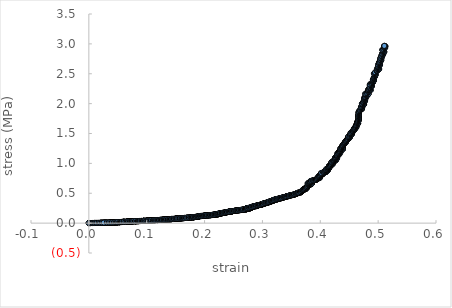
| Category | Series 0 |
|---|---|
| -0.00019422907024783148 | 0 |
| -0.00019422907024783148 | 0 |
| 0.0005007324903722929 | 0 |
| -0.0002555723664461956 | 0 |
| 6.132766122114415e-05 | 0.001 |
| 0.0 | 0.001 |
| 0.0 | 0.001 |
| 0.00031681910013293995 | 0.001 |
| -0.0003271443418882408 | 0 |
| 0.00018397166138515653 | 0 |
| 0.0002452880816213144 | 0 |
| 0.0 | 0.001 |
| 0.001970823531875488 | 0.001 |
| 0.002674476666898595 | 0.001 |
| 0.0031840613443490156 | 0.001 |
| 0.002674476666898595 | 0.001 |
| -7.155368530579731e-05 | 0.001 |
| 0.00031681910013293995 | 0.001 |
| -7.155368530579731e-05 | 0.001 |
| 0.002674476666898595 | 0.001 |
| 0.003499873115924939 | 0.001 |
| 0.005911017968440343 | 0.001 |
| 0.006104064549347594 | 0.001 |
| 0.005789074271497078 | 0.001 |
| 0.0036322811246846777 | 0.002 |
| 0.002990450188354925 | 0.002 |
| 0.005850047978751752 | 0.002 |
| 0.007434059230218116 | 0.002 |
| 0.009086470519888975 | 0.002 |
| 0.009521933733494064 | 0.002 |
| 0.00883321129383255 | 0.002 |
| 0.006165019054087078 | 0.002 |
| 0.007565946581062292 | 0.002 |
| 0.008954785957806435 | 0.002 |
| 0.00959280459431884 | 0.003 |
| 0.00984587154373883 | 0.003 |
| 0.011736786147582721 | 0.003 |
| 0.011989319118557815 | 0.003 |
| 0.011615557200545662 | 0.003 |
| 0.009653543637057733 | 0.003 |
| 0.00984587154373883 | 0.003 |
| 0.011676173511121391 | 0.003 |
| 0.013250988600911593 | 0.003 |
| 0.01388627292834074 | 0.003 |
| 0.014450631494363755 | 0.004 |
| 0.014198719399812928 | 0.004 |
| 0.01412818215084565 | 0.004 |
| 0.014631962578784456 | 0.004 |
| 0.01400723485460206 | 0.004 |
| 0.016775233965636866 | 0.004 |
| 0.017468550245519052 | 0.004 |
| 0.019966530072956335 | 0.004 |
| 0.020657638065205836 | 0.004 |
| 0.019906414230916346 | 0.004 |
| 0.018030891306773367 | 0.005 |
| 0.017468550245519052 | 0.005 |
| 0.019966530072956335 | 0.005 |
| 0.021718411273140496 | 0.005 |
| 0.022847998053342977 | 0.005 |
| 0.02290793732472039 | 0.005 |
| 0.02271811337668817 | 0.005 |
| 0.020287102630732884 | 0.005 |
| 0.020156884885051195 | 0.005 |
| 0.019906414230916346 | 0.005 |
| 0.02240831000338939 | 0.006 |
| 0.022847998053342977 | 0.006 |
| 0.022847998053342977 | 0.006 |
| 0.023097733101499877 | 0.006 |
| 0.022847998053342977 | 0.006 |
| 0.022847998053342977 | 0.006 |
| 0.023217585974407116 | 0.006 |
| 0.02584072590126089 | 0.006 |
| 0.027333737855004675 | 0.006 |
| 0.02875500317884615 | 0.006 |
| 0.02919191010796904 | 0.007 |
| 0.028943684740424934 | 0.007 |
| 0.028943684740424934 | 0.007 |
| 0.02938050925904356 | 0.007 |
| 0.028814589442823422 | 0.007 |
| 0.027015416673052944 | 0.007 |
| 0.026268947750183125 | 0.007 |
| 0.028814589442823422 | 0.007 |
| 0.02949961152842504 | 0.007 |
| 0.02875500317884615 | 0.008 |
| 0.026517830033072818 | 0.008 |
| 0.025900486064216355 | 0.008 |
| 0.026020003509482175 | 0.008 |
| 0.02633864165978307 | 0.008 |
| 0.02584072590126089 | 0.008 |
| 0.03111598990703239 | 0.008 |
| 0.03185885075842903 | 0.008 |
| 0.032037052787477996 | 0.009 |
| 0.031977650449101024 | 0.009 |
| 0.03185885075842903 | 0.009 |
| 0.034449571635362206 | 0.009 |
| 0.035495822754417504 | 0.009 |
| 0.03777207750859809 | 0.009 |
| 0.039375150274992006 | 0.009 |
| 0.04053405853690612 | 0.009 |
| 0.038696862140929066 | 0.009 |
| 0.03807715049436226 | 0.009 |
| 0.037831128909740705 | 0.01 |
| 0.03820506337307597 | 0.01 |
| 0.0376539565025511 | 0.01 |
| 0.03807715049436226 | 0.01 |
| 0.037959065520474476 | 0.01 |
| 0.037831128909740705 | 0.01 |
| 0.03691539749135247 | 0.01 |
| 0.03469642646142085 | 0.01 |
| 0.035002446807962814 | 0.01 |
| 0.035436633284940074 | 0.011 |
| 0.0375850467836038 | 0.011 |
| 0.039552018023367067 | 0.011 |
| 0.04072053085209076 | 0.011 |
| 0.04096585041044246 | 0.011 |
| 0.041024713521209066 | 0.011 |
| 0.04084810607645154 | 0.011 |
| 0.04132879597823537 | 0.011 |
| 0.040661649832935506 | 0.011 |
| 0.0432296943265158 | 0.012 |
| 0.04414944790030725 | 0.012 |
| 0.04640611189584293 | 0.012 |
| 0.046591500218072956 | 0.012 |
| 0.04640611189584293 | 0.012 |
| 0.044882693053802 | 0.012 |
| 0.04377773775988263 | 0.012 |
| 0.04371902878785748 | 0.012 |
| 0.044941326064711885 | 0.013 |
| 0.0463475647093781 | 0.013 |
| 0.04707919279440845 | 0.013 |
| 0.046220696873902026 | 0.013 |
| 0.0439636139475664 | 0.013 |
| 0.04414944790030725 | 0.013 |
| 0.043601608198186474 | 0.013 |
| 0.04433525501518401 | 0.013 |
| 0.04426680418370824 | 0.013 |
| 0.049085993933751425 | 0.014 |
| 0.049630830462436014 | 0.014 |
| 0.04957247177558727 | 0.014 |
| 0.049630830462436014 | 0.014 |
| 0.04895946540905637 | 0.014 |
| 0.04665003312495934 | 0.014 |
| 0.04822921219372078 | 0.014 |
| 0.0492027723438054 | 0.014 |
| 0.05000037935100698 | 0.014 |
| 0.04957247177558727 | 0.014 |
| 0.049630830462436014 | 0.015 |
| 0.048901067527925106 | 0.015 |
| 0.04646465565473518 | 0.015 |
| 0.04695241775093902 | 0.015 |
| 0.04689390254134561 | 0.015 |
| 0.04957247177558727 | 0.015 |
| 0.04968919339266308 | 0.015 |
| 0.0492027723438054 | 0.015 |
| 0.05200133265642445 | 0.016 |
| 0.052660958788462976 | 0.016 |
| 0.052544583545907186 | 0.016 |
| 0.0523602956787067 | 0.016 |
| 0.052243893068510995 | 0.016 |
| 0.05290335927350552 | 0.016 |
| 0.05272883745734763 | 0.016 |
| 0.05532414551323502 | 0.016 |
| 0.05544987133216124 | 0.016 |
| 0.05532414551323502 | 0.017 |
| 0.05321354678910859 | 0.017 |
| 0.05230209606730491 | 0.017 |
| 0.05230209606730491 | 0.017 |
| 0.05272883745734763 | 0.017 |
| 0.052243893068510995 | 0.017 |
| 0.05278701223858717 | 0.017 |
| 0.052243893068510995 | 0.017 |
| 0.052243893068510995 | 0.017 |
| 0.05175870576140698 | 0.017 |
| 0.04951410203254819 | 0.017 |
| 0.04975727407417879 | 0.018 |
| 0.04975727407417879 | 0.018 |
| 0.05217598147314629 | 0.018 |
| 0.053572082632199064 | 0.018 |
| 0.05520808741212849 | 0.018 |
| 0.05574960709299027 | 0.018 |
| 0.05544987133216124 | 0.018 |
| 0.05538217711861749 | 0.018 |
| 0.05629082609040494 | 0.019 |
| 0.057382048621037275 | 0.019 |
| 0.0577390932837422 | 0.019 |
| 0.05743995333938965 | 0.019 |
| 0.05762330754647387 | 0.019 |
| 0.057555760307176886 | 0.019 |
| 0.05749786229440041 | 0.019 |
| 0.05762330754647387 | 0.019 |
| 0.05768119829688549 | 0.02 |
| 0.0577390932837422 | 0.02 |
| 0.0577390932837422 | 0.02 |
| 0.05743995333938965 | 0.02 |
| 0.05803814377014822 | 0.02 |
| 0.05762330754647387 | 0.02 |
| 0.057555760307176886 | 0.02 |
| 0.05822138075541285 | 0.02 |
| 0.057382048621037275 | 0.021 |
| 0.059965323763090286 | 0.021 |
| 0.0605042741172144 | 0.021 |
| 0.060687067379437215 | 0.021 |
| 0.060812120787432554 | 0.021 |
| 0.0605042741172144 | 0.021 |
| 0.060812120787432554 | 0.021 |
| 0.06062934281909823 | 0.021 |
| 0.0605042741172144 | 0.021 |
| 0.060571622492570636 | 0.022 |
| 0.06044654657102045 | 0.022 |
| 0.06092753035150526 | 0.022 |
| 0.06062934281909823 | 0.022 |
| 0.060571622492570636 | 0.022 |
| 0.060985237702162666 | 0.022 |
| 0.0605042741172144 | 0.022 |
| 0.06062934281909823 | 0.022 |
| 0.060687067379437215 | 0.023 |
| 0.06308911414039864 | 0.023 |
| 0.06476710986046422 | 0.023 |
| 0.06614576229385935 | 0.023 |
| 0.06434547597822218 | 0.023 |
| 0.06351127042447355 | 0.023 |
| 0.06614576229385935 | 0.023 |
| 0.06686305305014417 | 0.023 |
| 0.06614576229385935 | 0.024 |
| 0.06835338410027192 | 0.024 |
| 0.06870652609959721 | 0.024 |
| 0.06662401329416213 | 0.024 |
| 0.06655707132004716 | 0.024 |
| 0.06614576229385935 | 0.024 |
| 0.0667387616136198 | 0.024 |
| 0.06626056550178977 | 0.024 |
| 0.06620316178347704 | 0.024 |
| 0.06620316178347704 | 0.024 |
| 0.06626056550178977 | 0.025 |
| 0.0667387616136198 | 0.025 |
| 0.066442302148843 | 0.025 |
| 0.06620316178347704 | 0.025 |
| 0.06769447588140913 | 0.025 |
| 0.06883058071937473 | 0.025 |
| 0.06888782631287999 | 0.025 |
| 0.06918356177171299 | 0.025 |
| 0.07180317183860627 | 0.026 |
| 0.07209803902943553 | 0.026 |
| 0.07192683544237108 | 0.026 |
| 0.07192683544237108 | 0.026 |
| 0.07209803902943553 | 0.026 |
| 0.07209803902943553 | 0.026 |
| 0.07222166617649 | 0.026 |
| 0.07180317183860627 | 0.026 |
| 0.07031797706945701 | 0.027 |
| 0.06912632560406265 | 0.027 |
| 0.06888782631287999 | 0.027 |
| 0.06876378629931865 | 0.027 |
| 0.06876378629931865 | 0.027 |
| 0.06888782631287999 | 0.027 |
| 0.06883058071937473 | 0.027 |
| 0.07156530271205995 | 0.027 |
| 0.07204097691704152 | 0.027 |
| 0.07198390406810462 | 0.028 |
| 0.0723928192992343 | 0.028 |
| 0.0718602475218867 | 0.028 |
| 0.07209803902943553 | 0.028 |
| 0.07281107447140123 | 0.028 |
| 0.07471003536511588 | 0.028 |
| 0.07476694538279555 | 0.028 |
| 0.07489024304079524 | 0.029 |
| 0.07518420894915377 | 0.029 |
| 0.07547808846695207 | 0.029 |
| 0.07476694538279555 | 0.029 |
| 0.07547808846695207 | 0.029 |
| 0.075127315216877 | 0.029 |
| 0.07507042570473911 | 0.029 |
| 0.07494715026220783 | 0.029 |
| 0.07476694538279555 | 0.029 |
| 0.07542121145259696 | 0.03 |
| 0.07507042570473911 | 0.03 |
| 0.07494715026220783 | 0.03 |
| 0.07565815779916259 | 0.03 |
| 0.07731521950557527 | 0.03 |
| 0.07991361202964987 | 0.03 |
| 0.08044193541650145 | 0.03 |
| 0.07784489479537025 | 0.03 |
| 0.07784489479537025 | 0.031 |
| 0.07731521950557527 | 0.031 |
| 0.07991361202964987 | 0.031 |
| 0.08062112062269089 | 0.031 |
| 0.08062112062269089 | 0.031 |
| 0.08132812900120809 | 0.031 |
| 0.08303224888456362 | 0.032 |
| 0.08373755522895576 | 0.032 |
| 0.08308869466121557 | 0.032 |
| 0.08096997982513636 | 0.032 |
| 0.08062112062269089 | 0.032 |
| 0.08056453538597183 | 0.032 |
| 0.08120562261829078 | 0.032 |
| 0.08079085712405053 | 0.032 |
| 0.08290995110218473 | 0.032 |
| 0.08290995110218473 | 0.033 |
| 0.08049852759079817 | 0.033 |
| 0.0806777026577023 | 0.033 |
| 0.08079085712405053 | 0.033 |
| 0.08303224888456362 | 0.033 |
| 0.0842074832450469 | 0.033 |
| 0.0855501947629191 | 0.033 |
| 0.08585042065028996 | 0.034 |
| 0.08572846705986165 | 0.034 |
| 0.08590670758145694 | 0.034 |
| 0.08619746064056119 | 0.034 |
| 0.0855501947629191 | 0.034 |
| 0.08749073689074487 | 0.034 |
| 0.08866067263798309 | 0.034 |
| 0.08853906130757119 | 0.035 |
| 0.08877292744208812 | 0.035 |
| 0.08848292235282766 | 0.035 |
| 0.08707857060561433 | 0.035 |
| 0.08619746064056119 | 0.035 |
| 0.08608491633903023 | 0.035 |
| 0.08690053885374142 | 0.035 |
| 0.08848292235282766 | 0.035 |
| 0.08848292235282766 | 0.035 |
| 0.0885951971109094 | 0.036 |
| 0.08866067263798309 | 0.036 |
| 0.0885951971109094 | 0.036 |
| 0.08842678024632515 | 0.036 |
| 0.08871680161517824 | 0.036 |
| 0.08866067263798309 | 0.036 |
| 0.09098719819029125 | 0.036 |
| 0.09215312613409099 | 0.037 |
| 0.09110851218168976 | 0.037 |
| 0.09367137789464822 | 0.037 |
| 0.09430411996419734 | 0.037 |
| 0.09163095556017277 | 0.037 |
| 0.09209718970864632 | 0.037 |
| 0.0943692227736259 | 0.037 |
| 0.0951223515840078 | 0.038 |
| 0.09448083862679169 | 0.038 |
| 0.09697942308282355 | 0.038 |
| 0.09697942308282355 | 0.038 |
| 0.09430411996419734 | 0.038 |
| 0.09471331946197319 | 0.038 |
| 0.09442503225747093 | 0.038 |
| 0.0943692227736259 | 0.038 |
| 0.09529892572170535 | 0.039 |
| 0.09726697493459072 | 0.039 |
| 0.09610699760123201 | 0.039 |
| 0.0943692227736259 | 0.039 |
| 0.09442503225747093 | 0.039 |
| 0.09553121646716929 | 0.039 |
| 0.09715566964287933 | 0.039 |
| 0.09801792534132035 | 0.04 |
| 0.09755444412405935 | 0.04 |
| 0.10010086385643564 | 0.04 |
| 0.10033204195859431 | 0.04 |
| 0.10004537024933235 | 0.04 |
| 0.10033204195859431 | 0.04 |
| 0.10004537024933235 | 0.04 |
| 0.0999898735625177 | 0.041 |
| 0.10033204195859431 | 0.041 |
| 0.0999898735625177 | 0.041 |
| 0.10120071812814412 | 0.041 |
| 0.10275151227254416 | 0.041 |
| 0.10050769867231697 | 0.041 |
| 0.10050769867231697 | 0.041 |
| 0.10004537024933235 | 0.041 |
| 0.10200410948047423 | 0.042 |
| 0.10246553341765036 | 0.042 |
| 0.10252089288726986 | 0.042 |
| 0.10304661879715285 | 0.042 |
| 0.10229022030442626 | 0.042 |
| 0.1031019461084281 | 0.042 |
| 0.10252089288726986 | 0.042 |
| 0.10258546297060885 | 0.043 |
| 0.10304661879715285 | 0.043 |
| 0.10522954245098518 | 0.043 |
| 0.105864199077422 | 0.043 |
| 0.10534914099506427 | 0.043 |
| 0.10545953808613362 | 0.043 |
| 0.10545953808613362 | 0.043 |
| 0.10522954245098518 | 0.044 |
| 0.10712306114001467 | 0.044 |
| 0.1084996349103657 | 0.044 |
| 0.10832537656095909 | 0.044 |
| 0.1084996349103657 | 0.044 |
| 0.1081602502968839 | 0.044 |
| 0.10729752911063653 | 0.045 |
| 0.10540434106403866 | 0.045 |
| 0.10522954245098518 | 0.045 |
| 0.10603888679825929 | 0.045 |
| 0.10827033750250996 | 0.045 |
| 0.10861884301818703 | 0.045 |
| 0.10844460544236012 | 0.045 |
| 0.1084996349103657 | 0.046 |
| 0.10872880764898564 | 0.046 |
| 0.10827033750250996 | 0.046 |
| 0.1084996349103657 | 0.046 |
| 0.10832537656095909 | 0.046 |
| 0.1107347463245245 | 0.046 |
| 0.111356714689508 | 0.046 |
| 0.11101837044403064 | 0.047 |
| 0.11164929302757529 | 0.047 |
| 0.11130184222500406 | 0.047 |
| 0.11124703867199423 | 0.047 |
| 0.1118138442102833 | 0.047 |
| 0.11335739412779035 | 0.047 |
| 0.11404156849036458 | 0.047 |
| 0.11375887239119789 | 0.048 |
| 0.11353077788446327 | 0.048 |
| 0.11341215391802746 | 0.048 |
| 0.11124703867199423 | 0.048 |
| 0.11290096982589036 | 0.048 |
| 0.11386827328154335 | 0.048 |
| 0.11375887239119789 | 0.049 |
| 0.11416011782106344 | 0.049 |
| 0.11603688894950583 | 0.049 |
| 0.11569095954429073 | 0.049 |
| 0.11358552818132496 | 0.049 |
| 0.11375887239119789 | 0.049 |
| 0.1142148336731597 | 0.049 |
| 0.11603688894950583 | 0.049 |
| 0.11813717087093689 | 0.05 |
| 0.11904497576659397 | 0.05 |
| 0.11904497576659397 | 0.05 |
| 0.11949860502599671 | 0.05 |
| 0.11920831456906024 | 0.05 |
| 0.1179100729601511 | 0.05 |
| 0.1163735397467632 | 0.05 |
| 0.11887261690960382 | 0.051 |
| 0.1196074511410218 | 0.051 |
| 0.11898145981011553 | 0.051 |
| 0.11972534251171325 | 0.051 |
| 0.11909942499853256 | 0.051 |
| 0.11909942499853256 | 0.051 |
| 0.11920831456906024 | 0.052 |
| 0.11909942499853256 | 0.052 |
| 0.11898145981011553 | 0.052 |
| 0.11915387126591372 | 0.052 |
| 0.1211933625001244 | 0.052 |
| 0.12181789999482623 | 0.052 |
| 0.12147396498490247 | 0.053 |
| 0.12198982315072299 | 0.053 |
| 0.12159170771034984 | 0.053 |
| 0.12198982315072299 | 0.053 |
| 0.12227027340113505 | 0.053 |
| 0.1243575177875217 | 0.053 |
| 0.12463730489563275 | 0.053 |
| 0.12458315637175398 | 0.054 |
| 0.12446583634013964 | 0.054 |
| 0.12491701374481325 | 0.054 |
| 0.12446583634013964 | 0.054 |
| 0.12514252613470944 | 0.054 |
| 0.124529004915654 | 0.054 |
| 0.12678271687165768 | 0.055 |
| 0.1273947865996015 | 0.055 |
| 0.12722379025458574 | 0.055 |
| 0.12666558380184129 | 0.055 |
| 0.12458315637175398 | 0.055 |
| 0.124529004915654 | 0.055 |
| 0.12508840496164583 | 0.055 |
| 0.12706175556288005 | 0.056 |
| 0.12728678485957884 | 0.056 |
| 0.12722379025458574 | 0.056 |
| 0.1274487830957872 | 0.056 |
| 0.1274487830957872 | 0.056 |
| 0.12711577004408345 | 0.057 |
| 0.12711577004408345 | 0.057 |
| 0.1273947865996015 | 0.057 |
| 0.1293097730539749 | 0.057 |
| 0.13031518315671292 | 0.057 |
| 0.1297587001543633 | 0.057 |
| 0.12986643526728928 | 0.057 |
| 0.12981256916168302 | 0.058 |
| 0.13014468550286556 | 0.058 |
| 0.13020749638144818 | 0.058 |
| 0.12969586107928288 | 0.058 |
| 0.1299831234451621 | 0.058 |
| 0.1299202984714945 | 0.059 |
| 0.13216183583663113 | 0.059 |
| 0.13238572051561792 | 0.059 |
| 0.1297587001543633 | 0.059 |
| 0.13036902219599178 | 0.059 |
| 0.1300369803647041 | 0.059 |
| 0.1296419857844782 | 0.059 |
| 0.1305394816085087 | 0.059 |
| 0.13227825649113895 | 0.06 |
| 0.13272592362691368 | 0.06 |
| 0.13260955508147476 | 0.06 |
| 0.13255583653853534 | 0.06 |
| 0.13283333955663035 | 0.06 |
| 0.1323319899469431 | 0.06 |
| 0.1335580602753685 | 0.061 |
| 0.13445197960635724 | 0.061 |
| 0.13434480769347615 | 0.061 |
| 0.13506836401368638 | 0.061 |
| 0.13451459079877834 | 0.061 |
| 0.1346217445181988 | 0.061 |
| 0.13473787915708718 | 0.062 |
| 0.13489867491166707 | 0.062 |
| 0.13473787915708718 | 0.062 |
| 0.13445197960635724 | 0.062 |
| 0.13635351200239162 | 0.062 |
| 0.1374676866908755 | 0.063 |
| 0.13774383018553163 | 0.063 |
| 0.1376280441377051 | 0.063 |
| 0.1372984042741497 | 0.063 |
| 0.13824247457429625 | 0.063 |
| 0.13757459451254564 | 0.063 |
| 0.13740533019399834 | 0.064 |
| 0.1379130372226509 | 0.064 |
| 0.13985238984344955 | 0.064 |
| 0.1406874890400072 | 0.064 |
| 0.1400745595195866 | 0.064 |
| 0.1399057178630976 | 0.065 |
| 0.14034998417975783 | 0.065 |
| 0.13979905897977238 | 0.065 |
| 0.1401900626576376 | 0.065 |
| 0.1399679186441637 | 0.065 |
| 0.140296679847322 | 0.065 |
| 0.14057204334529277 | 0.065 |
| 0.1426303256761377 | 0.066 |
| 0.14201865592873977 | 0.066 |
| 0.1401900626576376 | 0.066 |
| 0.14185014222547762 | 0.066 |
| 0.14268350576347627 | 0.066 |
| 0.1401900626576376 | 0.066 |
| 0.1414065420265858 | 0.067 |
| 0.14278985745454068 | 0.067 |
| 0.14278985745454068 | 0.067 |
| 0.14295821289061325 | 0.067 |
| 0.14278985745454068 | 0.067 |
| 0.14301137554420332 | 0.067 |
| 0.14278985745454068 | 0.068 |
| 0.1426303256761377 | 0.068 |
| 0.1433479835171046 | 0.068 |
| 0.14278985745454068 | 0.068 |
| 0.14417133155722323 | 0.068 |
| 0.14544477187814733 | 0.069 |
| 0.14511769909493388 | 0.069 |
| 0.14578056188357222 | 0.069 |
| 0.14549780250737918 | 0.069 |
| 0.14571872161585217 | 0.069 |
| 0.1453387021821948 | 0.069 |
| 0.1453917384365185 | 0.07 |
| 0.1456657027011162 | 0.07 |
| 0.1452768345828693 | 0.07 |
| 0.1456657027011162 | 0.07 |
| 0.1453387021821948 | 0.07 |
| 0.14362250819314384 | 0.07 |
| 0.1431265399879041 | 0.07 |
| 0.14273668302284373 | 0.071 |
| 0.1440651266946248 | 0.071 |
| 0.14549780250737918 | 0.071 |
| 0.14737839674986197 | 0.071 |
| 0.14781935630940624 | 0.072 |
| 0.14765181735568755 | 0.072 |
| 0.14775764199672797 | 0.072 |
| 0.14781935630940624 | 0.072 |
| 0.1499595943727702 | 0.072 |
| 0.1505137342339043 | 0.072 |
| 0.15029387201587735 | 0.073 |
| 0.15105878956076466 | 0.073 |
| 0.15292896461335076 | 0.073 |
| 0.1511730310003227 | 0.073 |
| 0.15046096894368843 | 0.073 |
| 0.15034664612351512 | 0.074 |
| 0.15046096894368843 | 0.074 |
| 0.15046096894368843 | 0.074 |
| 0.1503994174461936 | 0.074 |
| 0.15068079443052085 | 0.074 |
| 0.1503994174461936 | 0.074 |
| 0.15155084014846126 | 0.075 |
| 0.1528675648420421 | 0.075 |
| 0.15083904716032184 | 0.075 |
| 0.150733548123162 | 0.075 |
| 0.15264821959053076 | 0.075 |
| 0.15254291125681108 | 0.076 |
| 0.15046096894368843 | 0.076 |
| 0.151937276613395 | 0.076 |
| 0.15320087198938598 | 0.076 |
| 0.1527096328306513 | 0.076 |
| 0.15385840009427168 | 0.077 |
| 0.15511957180645683 | 0.077 |
| 0.15369186995069015 | 0.077 |
| 0.15308686199176494 | 0.077 |
| 0.15259556680990158 | 0.077 |
| 0.15358667147049732 | 0.077 |
| 0.1551720918622643 | 0.078 |
| 0.1567026344161488 | 0.078 |
| 0.15779437799990137 | 0.078 |
| 0.15762850208129892 | 0.078 |
| 0.15757611088134696 | 0.078 |
| 0.1577332762474085 | 0.079 |
| 0.15751499579048747 | 0.079 |
| 0.15784675776612442 | 0.079 |
| 0.15757611088134696 | 0.079 |
| 0.15866697038049118 | 0.079 |
| 0.16040110972162686 | 0.08 |
| 0.16007889313169768 | 0.08 |
| 0.1604620486870266 | 0.08 |
| 0.15784675776612442 | 0.08 |
| 0.15833548045373397 | 0.08 |
| 0.1577332762474085 | 0.08 |
| 0.15811733142098502 | 0.081 |
| 0.15806496582580024 | 0.081 |
| 0.16007889313169768 | 0.081 |
| 0.1604620486870266 | 0.081 |
| 0.16024436312060658 | 0.081 |
| 0.15838783188554545 | 0.082 |
| 0.15811733142098502 | 0.082 |
| 0.16002663015686264 | 0.082 |
| 0.16094949520359975 | 0.082 |
| 0.16307051769872705 | 0.083 |
| 0.16263623371061428 | 0.083 |
| 0.1632875889872856 | 0.083 |
| 0.16274048453463857 | 0.083 |
| 0.16225397880658501 | 0.083 |
| 0.1604620486870266 | 0.083 |
| 0.16176716789613943 | 0.084 |
| 0.1632875889872856 | 0.084 |
| 0.16512639927836087 | 0.084 |
| 0.16566354992789578 | 0.085 |
| 0.16544699383580322 | 0.085 |
| 0.1636608496060304 | 0.085 |
| 0.1632875889872856 | 0.085 |
| 0.16274048453463857 | 0.085 |
| 0.16279260587134617 | 0.085 |
| 0.1631226218369513 | 0.085 |
| 0.16452827195662428 | 0.086 |
| 0.16582809847509436 | 0.086 |
| 0.16550762609402248 | 0.086 |
| 0.16566354992789578 | 0.086 |
| 0.16550762609402248 | 0.087 |
| 0.16517839640946672 | 0.087 |
| 0.1657761351165375 | 0.087 |
| 0.1678264674760927 | 0.087 |
| 0.16928592936977965 | 0.088 |
| 0.17068301648097348 | 0.088 |
| 0.17046754477825402 | 0.088 |
| 0.17068301648097348 | 0.088 |
| 0.16837079718413783 | 0.088 |
| 0.16880259840635592 | 0.089 |
| 0.1682066665371333 | 0.089 |
| 0.17003646203861134 | 0.089 |
| 0.17101043915587233 | 0.089 |
| 0.17074333210656112 | 0.089 |
| 0.17101043915587233 | 0.09 |
| 0.17084674121912383 | 0.09 |
| 0.16928592936977965 | 0.09 |
| 0.168690353456658 | 0.09 |
| 0.17025202663747366 | 0.09 |
| 0.17197480493263065 | 0.091 |
| 0.17347986425562403 | 0.091 |
| 0.17347986425562403 | 0.091 |
| 0.17359157292224112 | 0.091 |
| 0.17331657009292606 | 0.091 |
| 0.17342829700138687 | 0.092 |
| 0.1735314288508166 | 0.092 |
| 0.173746241454338 | 0.092 |
| 0.17385792036993777 | 0.092 |
| 0.17605464015750685 | 0.093 |
| 0.17658588683096624 | 0.093 |
| 0.17626891148466778 | 0.093 |
| 0.17632033246783035 | 0.093 |
| 0.17632033246783035 | 0.094 |
| 0.17610607215960872 | 0.094 |
| 0.17643172429739865 | 0.094 |
| 0.17626891148466778 | 0.094 |
| 0.17605464015750685 | 0.094 |
| 0.17637175080701104 | 0.095 |
| 0.17621748785725208 | 0.095 |
| 0.17632033246783035 | 0.095 |
| 0.17626891148466778 | 0.095 |
| 0.17621748785725208 | 0.095 |
| 0.17648313690946263 | 0.095 |
| 0.17835772242619818 | 0.096 |
| 0.17878523366109886 | 0.096 |
| 0.17872540115713365 | 0.096 |
| 0.17893910104136646 | 0.097 |
| 0.17888781454514022 | 0.097 |
| 0.17857150088938026 | 0.097 |
| 0.1792039609808329 | 0.097 |
| 0.18097116793723939 | 0.098 |
| 0.18123555734211677 | 0.098 |
| 0.1810223476995252 | 0.098 |
| 0.1806981873237089 | 0.098 |
| 0.18123555734211677 | 0.098 |
| 0.1810223476995252 | 0.099 |
| 0.1807579019108126 | 0.099 |
| 0.18112469936666223 | 0.099 |
| 0.1806981873237089 | 0.099 |
| 0.18133788719033403 | 0.099 |
| 0.18112469936666223 | 0.1 |
| 0.18064699096785827 | 0.1 |
| 0.1810223476995252 | 0.1 |
| 0.17888781454514022 | 0.1 |
| 0.17947734973828935 | 0.1 |
| 0.18091146608425082 | 0.101 |
| 0.1807579019108126 | 0.101 |
| 0.18123555734211677 | 0.101 |
| 0.18091146608425082 | 0.101 |
| 0.18112469936666223 | 0.101 |
| 0.1810223476995252 | 0.102 |
| 0.18277777639699475 | 0.102 |
| 0.1837904666992485 | 0.102 |
| 0.18357780115054345 | 0.103 |
| 0.18421559530337403 | 0.103 |
| 0.18591457167019215 | 0.103 |
| 0.18436862945646304 | 0.103 |
| 0.18373086603771033 | 0.103 |
| 0.18346720254198604 | 0.103 |
| 0.1841050672153697 | 0.104 |
| 0.18362884768308155 | 0.104 |
| 0.18490403123160068 | 0.104 |
| 0.18622857148277056 | 0.105 |
| 0.1858042312177186 | 0.105 |
| 0.18591457167019215 | 0.105 |
| 0.18591457167019215 | 0.105 |
| 0.185591993541837 | 0.105 |
| 0.18617765748814055 | 0.106 |
| 0.18797489272918586 | 0.106 |
| 0.18855916316592172 | 0.106 |
| 0.18844911414939292 | 0.107 |
| 0.18855916316592172 | 0.107 |
| 0.18850836769586826 | 0.107 |
| 0.18850836769586826 | 0.107 |
| 0.18844911414939292 | 0.107 |
| 0.18839831308889812 | 0.108 |
| 0.18823743713496507 | 0.108 |
| 0.18855916316592172 | 0.108 |
| 0.18844911414939292 | 0.108 |
| 0.18866074636614477 | 0.108 |
| 0.18850836769586826 | 0.109 |
| 0.18829670322500994 | 0.109 |
| 0.18850836769586826 | 0.109 |
| 0.18813581092234724 | 0.109 |
| 0.18860995605592648 | 0.11 |
| 0.18850836769586826 | 0.11 |
| 0.18950676112674872 | 0.11 |
| 0.19067317371182133 | 0.11 |
| 0.18855916316592172 | 0.11 |
| 0.18844911414939292 | 0.111 |
| 0.18844911414939292 | 0.111 |
| 0.18823743713496507 | 0.111 |
| 0.18855916316592172 | 0.111 |
| 0.1903014227288697 | 0.112 |
| 0.19067317371182133 | 0.112 |
| 0.19062248551322217 | 0.112 |
| 0.19067317371182133 | 0.112 |
| 0.19062248551322217 | 0.113 |
| 0.18882148768548618 | 0.113 |
| 0.1889315622794363 | 0.113 |
| 0.19056335710710157 | 0.113 |
| 0.19067317371182133 | 0.114 |
| 0.19067317371182133 | 0.114 |
| 0.19062248551322217 | 0.114 |
| 0.19056335710710157 | 0.114 |
| 0.19062248551322217 | 0.114 |
| 0.18919378914057455 | 0.114 |
| 0.18855916316592172 | 0.115 |
| 0.19014085267292616 | 0.115 |
| 0.19067317371182133 | 0.115 |
| 0.19062248551322217 | 0.116 |
| 0.19188036109390802 | 0.116 |
| 0.19325467209521457 | 0.116 |
| 0.19082522289368065 | 0.116 |
| 0.1907238593412569 | 0.116 |
| 0.19056335710710157 | 0.117 |
| 0.19188036109390802 | 0.117 |
| 0.19335571319964984 | 0.117 |
| 0.19493830719748417 | 0.118 |
| 0.19551012842328094 | 0.118 |
| 0.1956698387133854 | 0.118 |
| 0.1943577531219283 | 0.119 |
| 0.19325467209521457 | 0.119 |
| 0.19320411458267045 | 0.119 |
| 0.19372633068938658 | 0.119 |
| 0.1956698387133854 | 0.12 |
| 0.19519902998575564 | 0.12 |
| 0.19598918279182728 | 0.12 |
| 0.19529994095532008 | 0.12 |
| 0.19540923866277884 | 0.12 |
| 0.19320411458267045 | 0.12 |
| 0.19398736961785185 | 0.121 |
| 0.19582952350018634 | 0.121 |
| 0.19524948674341563 | 0.121 |
| 0.19619915938992077 | 0.122 |
| 0.198297163235399 | 0.122 |
| 0.19802887217432055 | 0.122 |
| 0.1984479917741583 | 0.123 |
| 0.19802887217432055 | 0.123 |
| 0.19860729948921038 | 0.123 |
| 0.1983976961489213 | 0.123 |
| 0.19928583608073244 | 0.124 |
| 0.20070019663470431 | 0.124 |
| 0.20038235369103943 | 0.124 |
| 0.20033215526414752 | 0.125 |
| 0.20049109734180512 | 0.125 |
| 0.20054128779088884 | 0.125 |
| 0.20054128779088884 | 0.125 |
| 0.20038235369103943 | 0.125 |
| 0.2004409043735136 | 0.126 |
| 0.20038235369103943 | 0.126 |
| 0.2009593559295884 | 0.126 |
| 0.2006500141608931 | 0.127 |
| 0.2027887227083484 | 0.127 |
| 0.20320591812057814 | 0.127 |
| 0.20309746930495043 | 0.127 |
| 0.20304740699113769 | 0.128 |
| 0.20330595877652818 | 0.128 |
| 0.20471464883616905 | 0.128 |
| 0.20518099981462426 | 0.129 |
| 0.20518099981462426 | 0.129 |
| 0.20513104170118537 | 0.129 |
| 0.2054390006149347 | 0.13 |
| 0.2072103439034274 | 0.13 |
| 0.2079328908270913 | 0.13 |
| 0.20762569909001402 | 0.131 |
| 0.2077751925709172 | 0.131 |
| 0.20783331200624242 | 0.131 |
| 0.20746788705427194 | 0.131 |
| 0.2079328908270913 | 0.132 |
| 0.21021356576006503 | 0.132 |
| 0.21000644647871838 | 0.132 |
| 0.2104702715822386 | 0.133 |
| 0.21016385843878213 | 0.133 |
| 0.21021356576006503 | 0.133 |
| 0.21021356576006503 | 0.133 |
| 0.21155460019927197 | 0.134 |
| 0.21290208998378277 | 0.134 |
| 0.21295166138446003 | 0.134 |
| 0.2130590468299375 | 0.135 |
| 0.21269559184130482 | 0.135 |
| 0.21295166138446003 | 0.135 |
| 0.21290208998378277 | 0.135 |
| 0.21233193969737996 | 0.136 |
| 0.21279468768119622 | 0.136 |
| 0.21285251612565975 | 0.136 |
| 0.21310861045084759 | 0.137 |
| 0.2130012303279353 | 0.137 |
| 0.21253857793355335 | 0.137 |
| 0.21264600774496134 | 0.137 |
| 0.21274510849830894 | 0.137 |
| 0.21387650015557463 | 0.138 |
| 0.21537746028114377 | 0.138 |
| 0.2149653778794471 | 0.139 |
| 0.21522086693281323 | 0.139 |
| 0.2152703235244713 | 0.139 |
| 0.21517140789507955 | 0.139 |
| 0.2154763555318415 | 0.14 |
| 0.2149653778794471 | 0.14 |
| 0.2160447811197411 | 0.14 |
| 0.2181015369369144 | 0.141 |
| 0.218356290710241 | 0.141 |
| 0.21824947263795605 | 0.141 |
| 0.21799469164740215 | 0.142 |
| 0.21789604514712013 | 0.142 |
| 0.21531977767029606 | 0.142 |
| 0.2164070858284366 | 0.142 |
| 0.21830698650850816 | 0.143 |
| 0.21794536961365282 | 0.143 |
| 0.21815085126896522 | 0.143 |
| 0.2181015369369144 | 0.143 |
| 0.21769051112177118 | 0.144 |
| 0.2184055924811894 | 0.144 |
| 0.21824947263795605 | 0.144 |
| 0.21856168795482167 | 0.145 |
| 0.22040830267596898 | 0.145 |
| 0.22056408587275778 | 0.145 |
| 0.22061327891823798 | 0.146 |
| 0.22198963822407713 | 0.146 |
| 0.22275884709995147 | 0.146 |
| 0.22061327891823798 | 0.146 |
| 0.22020328440982606 | 0.147 |
| 0.22066246954388147 | 0.147 |
| 0.22219422624965754 | 0.147 |
| 0.22301241731459343 | 0.148 |
| 0.22301241731459343 | 0.148 |
| 0.22275884709995147 | 0.148 |
| 0.22291426457985453 | 0.149 |
| 0.22071165774992618 | 0.149 |
| 0.22056408587275778 | 0.149 |
| 0.22040830267596898 | 0.149 |
| 0.22107227587068898 | 0.149 |
| 0.22301241731459343 | 0.15 |
| 0.22266066947222501 | 0.15 |
| 0.2229633421514689 | 0.151 |
| 0.22291426457985453 | 0.151 |
| 0.22301241731459343 | 0.151 |
| 0.22301241731459343 | 0.151 |
| 0.22266066947222501 | 0.152 |
| 0.22327408941753507 | 0.152 |
| 0.22306965790891814 | 0.152 |
| 0.22373186696859335 | 0.153 |
| 0.22516100042507142 | 0.153 |
| 0.22342126194518397 | 0.153 |
| 0.22321686052413006 | 0.153 |
| 0.22306965790891814 | 0.154 |
| 0.22275884709995147 | 0.154 |
| 0.22311872785498488 | 0.154 |
| 0.22434463037297947 | 0.155 |
| 0.22500593176226977 | 0.155 |
| 0.225103879418761 | 0.155 |
| 0.22414041762189765 | 0.155 |
| 0.22311872785498488 | 0.156 |
| 0.22316779539331014 | 0.156 |
| 0.22311872785498488 | 0.156 |
| 0.22505490678973322 | 0.157 |
| 0.22489982167298478 | 0.157 |
| 0.22520996785881778 | 0.157 |
| 0.225103879418761 | 0.157 |
| 0.225103879418761 | 0.158 |
| 0.22516100042507142 | 0.158 |
| 0.22505490678973322 | 0.158 |
| 0.22536500488769481 | 0.159 |
| 0.22673478001364802 | 0.159 |
| 0.2276550953120321 | 0.16 |
| 0.2277039407715059 | 0.16 |
| 0.22775278384521735 | 0.16 |
| 0.22780975374796905 | 0.16 |
| 0.22714210591452713 | 0.161 |
| 0.22754926596856792 | 0.161 |
| 0.22754926596856792 | 0.161 |
| 0.227606247466563 | 0.162 |
| 0.22780975374796905 | 0.162 |
| 0.2276550953120321 | 0.162 |
| 0.2277039407715059 | 0.163 |
| 0.2277039407715059 | 0.163 |
| 0.22740269976192015 | 0.163 |
| 0.22780975374796905 | 0.163 |
| 0.2277039407715059 | 0.164 |
| 0.22775278384521735 | 0.164 |
| 0.22775278384521735 | 0.164 |
| 0.2279074271747044 | 0.165 |
| 0.23029725933309475 | 0.165 |
| 0.23009425869692698 | 0.165 |
| 0.23034597590833797 | 0.166 |
| 0.23014298516242904 | 0.166 |
| 0.22993995320291105 | 0.166 |
| 0.23029725933309475 | 0.167 |
| 0.23019170925377833 | 0.167 |
| 0.23014298516242904 | 0.167 |
| 0.23019170925377833 | 0.168 |
| 0.23003741879734596 | 0.168 |
| 0.23024043097120606 | 0.168 |
| 0.22983436540117433 | 0.168 |
| 0.23024043097120606 | 0.169 |
| 0.23034597590833797 | 0.169 |
| 0.22989121684313377 | 0.169 |
| 0.23029725933309475 | 0.17 |
| 0.23171704733718723 | 0.17 |
| 0.23232493868021017 | 0.171 |
| 0.23039469011039246 | 0.171 |
| 0.2309060141031031 | 0.171 |
| 0.23247078527807435 | 0.172 |
| 0.23237355657634012 | 0.172 |
| 0.23267330409943165 | 0.172 |
| 0.23474467892364306 | 0.173 |
| 0.23505178721172656 | 0.173 |
| 0.23510027271801695 | 0.173 |
| 0.23343440550773722 | 0.174 |
| 0.23247078527807435 | 0.174 |
| 0.2324221721088848 | 0.174 |
| 0.23328061459648963 | 0.174 |
| 0.23505178721172656 | 0.175 |
| 0.23505178721172656 | 0.175 |
| 0.23525378405830152 | 0.176 |
| 0.23510027271801695 | 0.176 |
| 0.23494673780838274 | 0.176 |
| 0.23520530599469536 | 0.177 |
| 0.23500329935447772 | 0.177 |
| 0.23514875587357714 | 0.177 |
| 0.23514875587357714 | 0.178 |
| 0.23540727183647153 | 0.178 |
| 0.23736820180914475 | 0.179 |
| 0.23696502087227686 | 0.179 |
| 0.2372150147378845 | 0.179 |
| 0.23716663166006907 | 0.18 |
| 0.2368682281798845 | 0.18 |
| 0.2372714481357424 | 0.18 |
| 0.23701341370539006 | 0.18 |
| 0.23731982614260275 | 0.181 |
| 0.23736820180914475 | 0.181 |
| 0.2368682281798845 | 0.181 |
| 0.23736820180914475 | 0.182 |
| 0.2374729971601816 | 0.182 |
| 0.23711824624121813 | 0.182 |
| 0.2372150147378845 | 0.183 |
| 0.2374729971601816 | 0.183 |
| 0.23958273271108974 | 0.184 |
| 0.23922872956616067 | 0.184 |
| 0.23968729625847895 | 0.184 |
| 0.23958273271108974 | 0.185 |
| 0.23942988452788244 | 0.185 |
| 0.23963099903442336 | 0.185 |
| 0.23948619307494629 | 0.185 |
| 0.23948619307494629 | 0.186 |
| 0.23942988452788244 | 0.186 |
| 0.23958273271108974 | 0.186 |
| 0.23958273271108974 | 0.187 |
| 0.23968729625847895 | 0.187 |
| 0.23963099903442336 | 0.188 |
| 0.24179237030031572 | 0.188 |
| 0.24224175049484417 | 0.189 |
| 0.24224175049484417 | 0.189 |
| 0.2423460363897034 | 0.189 |
| 0.24214546723066857 | 0.19 |
| 0.24214546723066857 | 0.19 |
| 0.2416880266468924 | 0.19 |
| 0.24219361002156456 | 0.191 |
| 0.2417442081882786 | 0.191 |
| 0.24199301028510434 | 0.191 |
| 0.24214546723066857 | 0.192 |
| 0.24219361002156456 | 0.192 |
| 0.2422898886507298 | 0.192 |
| 0.2430917452169988 | 0.193 |
| 0.2444455268837428 | 0.193 |
| 0.2444455268837428 | 0.194 |
| 0.24514167356205213 | 0.194 |
| 0.24693995818152825 | 0.195 |
| 0.24529365126339117 | 0.195 |
| 0.2446456352979749 | 0.195 |
| 0.24659652833399873 | 0.196 |
| 0.24693995818152825 | 0.196 |
| 0.24693995818152825 | 0.196 |
| 0.24659652833399873 | 0.197 |
| 0.24699584544299594 | 0.197 |
| 0.24693995818152825 | 0.197 |
| 0.24689204335712134 | 0.198 |
| 0.24699584544299594 | 0.198 |
| 0.24689204335712134 | 0.198 |
| 0.2468441262367742 | 0.199 |
| 0.24689204335712134 | 0.199 |
| 0.24669238400834168 | 0.199 |
| 0.2468441262367742 | 0.2 |
| 0.24828848101185827 | 0.2 |
| 0.2493325889924282 | 0.201 |
| 0.24709166285000278 | 0.201 |
| 0.24664445731970908 | 0.201 |
| 0.24693995818152825 | 0.201 |
| 0.24838417464781531 | 0.202 |
| 0.24953172194728176 | 0.203 |
| 0.2513697768741891 | 0.203 |
| 0.2515685046109994 | 0.204 |
| 0.2518148121783963 | 0.204 |
| 0.25132207383938876 | 0.204 |
| 0.2518704901557366 | 0.205 |
| 0.25176713036891313 | 0.205 |
| 0.25216438850576095 | 0.206 |
| 0.25419582148768005 | 0.206 |
| 0.25419582148768005 | 0.207 |
| 0.2540531718171971 | 0.207 |
| 0.25425136705661533 | 0.207 |
| 0.2534028230574729 | 0.208 |
| 0.2518704901557366 | 0.208 |
| 0.2529108043411008 | 0.208 |
| 0.2540531718171971 | 0.209 |
| 0.2542989305630221 | 0.209 |
| 0.2544415451829078 | 0.21 |
| 0.25597791209361304 | 0.21 |
| 0.2547426644865066 | 0.21 |
| 0.2543464294742026 | 0.211 |
| 0.25588294241227016 | 0.211 |
| 0.25588294241227016 | 0.212 |
| 0.25597791209361304 | 0.212 |
| 0.2574091439000936 | 0.213 |
| 0.25819903502489805 | 0.213 |
| 0.25830167009185134 | 0.214 |
| 0.25824641114094266 | 0.214 |
| 0.25824641114094266 | 0.214 |
| 0.25810427605878766 | 0.215 |
| 0.25834904134580977 | 0.215 |
| 0.2603679620259797 | 0.216 |
| 0.260415235500467 | 0.216 |
| 0.26071456164101614 | 0.217 |
| 0.26169850988204457 | 0.217 |
| 0.26277587897585764 | 0.218 |
| 0.26076175679932206 | 0.218 |
| 0.2602734083721323 | 0.218 |
| 0.2605649097702589 | 0.218 |
| 0.260470374737587 | 0.219 |
| 0.2605649097702589 | 0.219 |
| 0.2625793662386934 | 0.22 |
| 0.26262653529038876 | 0.22 |
| 0.26297235310335326 | 0.221 |
| 0.26282303875936286 | 0.221 |
| 0.26282303875936286 | 0.221 |
| 0.2630194418275407 | 0.222 |
| 0.2635143572474806 | 0.222 |
| 0.2654758542619829 | 0.223 |
| 0.2654758542619829 | 0.224 |
| 0.26542099034113686 | 0.224 |
| 0.2654758542619829 | 0.224 |
| 0.2655699173059892 | 0.225 |
| 0.2655228868899679 | 0.225 |
| 0.26674489786124167 | 0.226 |
| 0.267527451943162 | 0.226 |
| 0.2676291340876344 | 0.227 |
| 0.26787151787337654 | 0.227 |
| 0.27040966387840654 | 0.228 |
| 0.268793834851706 | 0.228 |
| 0.2675743881802924 | 0.228 |
| 0.26996497431292066 | 0.229 |
| 0.27040966387840654 | 0.23 |
| 0.27045646503328097 | 0.23 |
| 0.27157897487962124 | 0.231 |
| 0.27230320777030054 | 0.231 |
| 0.27065143605120245 | 0.231 |
| 0.2705500607724985 | 0.232 |
| 0.27234992039105194 | 0.232 |
| 0.27234992039105194 | 0.233 |
| 0.27234992039105194 | 0.233 |
| 0.2724044054879222 | 0.234 |
| 0.27234992039105194 | 0.234 |
| 0.2724511133818126 | 0.234 |
| 0.2733225530825451 | 0.235 |
| 0.27444179102715277 | 0.236 |
| 0.2726456959265117 | 0.236 |
| 0.27269239255185673 | 0.236 |
| 0.2745893806915015 | 0.237 |
| 0.27424755769145226 | 0.237 |
| 0.27434855884639114 | 0.237 |
| 0.27434855884639114 | 0.238 |
| 0.27444179102715277 | 0.238 |
| 0.2747835476515708 | 0.239 |
| 0.2753658224293602 | 0.239 |
| 0.2770563250513777 | 0.24 |
| 0.2768625989311799 | 0.24 |
| 0.27691683871491674 | 0.241 |
| 0.27720352936989684 | 0.241 |
| 0.27691683871491674 | 0.242 |
| 0.27696333632226355 | 0.242 |
| 0.27715704292987026 | 0.243 |
| 0.2766223239706245 | 0.243 |
| 0.2745893806915015 | 0.243 |
| 0.2745893806915015 | 0.243 |
| 0.27444179102715277 | 0.243 |
| 0.27444179102715277 | 0.244 |
| 0.2740067146234409 | 0.244 |
| 0.2724511133818126 | 0.244 |
| 0.2724511133818126 | 0.245 |
| 0.27230320777030054 | 0.245 |
| 0.2724044054879222 | 0.245 |
| 0.27210855856548377 | 0.246 |
| 0.2724044054879222 | 0.246 |
| 0.2722564929673781 | 0.246 |
| 0.27234992039105194 | 0.247 |
| 0.2724044054879222 | 0.247 |
| 0.2724044054879222 | 0.248 |
| 0.2724511133818126 | 0.248 |
| 0.2725445226252211 | 0.249 |
| 0.27234992039105194 | 0.249 |
| 0.2722564929673781 | 0.249 |
| 0.2724044054879222 | 0.25 |
| 0.2724978190941777 | 0.25 |
| 0.27337698521263404 | 0.251 |
| 0.27454283365397064 | 0.251 |
| 0.27434855884639114 | 0.252 |
| 0.2746359866435908 | 0.252 |
| 0.2770563250513777 | 0.253 |
| 0.276040841570516 | 0.253 |
| 0.2744884038581462 | 0.254 |
| 0.27633552759451113 | 0.254 |
| 0.27720352936989684 | 0.255 |
| 0.27715704292987026 | 0.255 |
| 0.277830854452045 | 0.256 |
| 0.27933166963219513 | 0.257 |
| 0.2774978730155454 | 0.257 |
| 0.27720352936989684 | 0.257 |
| 0.2794785394154966 | 0.258 |
| 0.2792852820189317 | 0.258 |
| 0.27942443840378833 | 0.259 |
| 0.2811158068140762 | 0.26 |
| 0.28121611667940494 | 0.26 |
| 0.28154786251369235 | 0.261 |
| 0.2814090013238521 | 0.261 |
| 0.28135500465415964 | 0.262 |
| 0.28005808761566203 | 0.262 |
| 0.2796717594708563 | 0.262 |
| 0.2814552905296576 | 0.263 |
| 0.2814552905296576 | 0.263 |
| 0.28135500465415964 | 0.264 |
| 0.2814090013238521 | 0.264 |
| 0.28106950189080787 | 0.264 |
| 0.27961766891182155 | 0.264 |
| 0.28034387924538257 | 0.265 |
| 0.2814552905296576 | 0.266 |
| 0.2814552905296576 | 0.266 |
| 0.2814090013238521 | 0.267 |
| 0.28154786251369235 | 0.267 |
| 0.28135500465415964 | 0.268 |
| 0.2814552905296576 | 0.268 |
| 0.2816481290511054 | 0.269 |
| 0.2814552905296576 | 0.269 |
| 0.2814552905296576 | 0.269 |
| 0.2814552905296576 | 0.27 |
| 0.2814552905296576 | 0.27 |
| 0.2816481290511054 | 0.271 |
| 0.2814090013238521 | 0.271 |
| 0.2815015775928714 | 0.271 |
| 0.2816944071894575 | 0.272 |
| 0.2814090013238521 | 0.273 |
| 0.28338194383458926 | 0.273 |
| 0.28352053134833044 | 0.274 |
| 0.2840515753743362 | 0.275 |
| 0.28376684156176113 | 0.275 |
| 0.28381302175610074 | 0.275 |
| 0.2837129720610372 | 0.276 |
| 0.28381302175610074 | 0.276 |
| 0.2840054061953893 | 0.277 |
| 0.28486683928321904 | 0.277 |
| 0.28578123162822916 | 0.278 |
| 0.2859271572827495 | 0.279 |
| 0.285689050725256 | 0.279 |
| 0.2840054061953893 | 0.279 |
| 0.28424391392950693 | 0.279 |
| 0.2858273188934168 | 0.28 |
| 0.2857351422389073 | 0.281 |
| 0.2858273188934168 | 0.281 |
| 0.28841994324497555 | 0.282 |
| 0.28827438092530827 | 0.283 |
| 0.28841994324497555 | 0.283 |
| 0.2861652071590062 | 0.283 |
| 0.28607306164608026 | 0.283 |
| 0.28846590906225955 | 0.285 |
| 0.28846590906225955 | 0.285 |
| 0.28832035343381657 | 0.286 |
| 0.2896602191305065 | 0.286 |
| 0.2898514218909065 | 0.287 |
| 0.28851187276678447 | 0.287 |
| 0.2882284063032314 | 0.287 |
| 0.2883663238289504 | 0.288 |
| 0.2885578343587443 | 0.288 |
| 0.2885578343587443 | 0.289 |
| 0.2901879534197336 | 0.29 |
| 0.28999675485041576 | 0.29 |
| 0.29013442872216233 | 0.291 |
| 0.2903791154391465 | 0.291 |
| 0.2902797205602581 | 0.292 |
| 0.2902797205602581 | 0.292 |
| 0.2897596154364154 | 0.292 |
| 0.2902797205602581 | 0.293 |
| 0.2918536046768372 | 0.294 |
| 0.29218946319513783 | 0.294 |
| 0.2926167618678956 | 0.295 |
| 0.2922352560734769 | 0.295 |
| 0.29238024302100496 | 0.296 |
| 0.2908988985413441 | 0.296 |
| 0.2902797205602581 | 0.296 |
| 0.2926167618678956 | 0.298 |
| 0.29242602716401994 | 0.298 |
| 0.29257098645687246 | 0.298 |
| 0.29242602716401994 | 0.299 |
| 0.29257098645687246 | 0.299 |
| 0.2926167618678956 | 0.3 |
| 0.29267015386765094 | 0.3 |
| 0.2925252089503654 | 0.301 |
| 0.29414127134131096 | 0.302 |
| 0.2945677370000567 | 0.302 |
| 0.2949483541455932 | 0.303 |
| 0.2947580636815012 | 0.303 |
| 0.29490268534227093 | 0.304 |
| 0.2949483541455932 | 0.304 |
| 0.2946667066056017 | 0.305 |
| 0.2949483541455932 | 0.305 |
| 0.29585363829175126 | 0.306 |
| 0.2970391031131945 | 0.307 |
| 0.2969935296943045 | 0.307 |
| 0.2968492101208192 | 0.308 |
| 0.29713782844265546 | 0.308 |
| 0.2969479541983829 | 0.309 |
| 0.2969935296943045 | 0.309 |
| 0.29727452274409844 | 0.31 |
| 0.29718339528598287 | 0.31 |
| 0.29964831354660754 | 0.312 |
| 0.29954983576695465 | 0.312 |
| 0.29954983576695465 | 0.313 |
| 0.29950437662981066 | 0.313 |
| 0.29950437662981066 | 0.314 |
| 0.29950437662981066 | 0.314 |
| 0.29950437662981066 | 0.315 |
| 0.29950437662981066 | 0.315 |
| 0.29950437662981066 | 0.316 |
| 0.29936041899219523 | 0.316 |
| 0.29950437662981066 | 0.317 |
| 0.2996937661411229 | 0.317 |
| 0.29941345215545345 | 0.318 |
| 0.29954983576695465 | 0.318 |
| 0.29945891542603953 | 0.319 |
| 0.30172926932784344 | 0.32 |
| 0.30158563164746155 | 0.32 |
| 0.30172926932784344 | 0.321 |
| 0.30172926932784344 | 0.321 |
| 0.3013966001307545 | 0.322 |
| 0.29979222974854985 | 0.322 |
| 0.3002616600240723 | 0.322 |
| 0.3016763588408419 | 0.323 |
| 0.30172926932784344 | 0.324 |
| 0.30163099627307965 | 0.324 |
| 0.3017746274380077 | 0.325 |
| 0.30163099627307965 | 0.325 |
| 0.3017746274380077 | 0.326 |
| 0.30186533748672817 | 0.326 |
| 0.30163099627307965 | 0.327 |
| 0.30370783454386124 | 0.328 |
| 0.30394168963058993 | 0.329 |
| 0.3038964297100658 | 0.329 |
| 0.30398694750274635 | 0.33 |
| 0.30375310300079916 | 0.33 |
| 0.30398694750274635 | 0.331 |
| 0.30403973587973065 | 0.331 |
| 0.3038511677409885 | 0.332 |
| 0.30394168963058993 | 0.332 |
| 0.30394168963058993 | 0.333 |
| 0.3059234049583275 | 0.334 |
| 0.3058255432310679 | 0.334 |
| 0.3058707159262003 | 0.335 |
| 0.3059234049583275 | 0.336 |
| 0.3059234049583275 | 0.336 |
| 0.3060589036625806 | 0.336 |
| 0.3057351917186252 | 0.337 |
| 0.3059685732330979 | 0.338 |
| 0.3058255432310679 | 0.338 |
| 0.3058707159262003 | 0.339 |
| 0.307660764728036 | 0.34 |
| 0.3080815047906548 | 0.341 |
| 0.30775094243727846 | 0.341 |
| 0.3078936973340403 | 0.341 |
| 0.3076081671586463 | 0.342 |
| 0.307848615932117 | 0.343 |
| 0.30831433942460024 | 0.343 |
| 0.30991259454896036 | 0.344 |
| 0.31018998128004477 | 0.345 |
| 0.31000256943093485 | 0.345 |
| 0.310145003281382 | 0.346 |
| 0.30892239519907805 | 0.346 |
| 0.3077960282425757 | 0.346 |
| 0.30793877670372266 | 0.347 |
| 0.30775094243727846 | 0.347 |
| 0.30977012758943717 | 0.348 |
| 0.30995758300188264 | 0.349 |
| 0.30995758300188264 | 0.35 |
| 0.3100475538362994 | 0.35 |
| 0.3096276403301875 | 0.35 |
| 0.310145003281382 | 0.351 |
| 0.3100475538362994 | 0.352 |
| 0.30995758300188264 | 0.352 |
| 0.31028741684731637 | 0.353 |
| 0.30977012758943717 | 0.353 |
| 0.31010002325960767 | 0.354 |
| 0.31056469964156236 | 0.355 |
| 0.3122042525129232 | 0.356 |
| 0.311081519250243 | 0.356 |
| 0.31018998128004477 | 0.356 |
| 0.31224913798805265 | 0.357 |
| 0.31210700354380755 | 0.358 |
| 0.31224913798805265 | 0.359 |
| 0.31402035786361976 | 0.36 |
| 0.31425181398434215 | 0.36 |
| 0.3145802347159075 | 0.361 |
| 0.3143936439254323 | 0.362 |
| 0.31449067078595366 | 0.362 |
| 0.31332566789613875 | 0.362 |
| 0.3123389028946462 | 0.362 |
| 0.31453545375364295 | 0.364 |
| 0.31476679069675456 | 0.365 |
| 0.3166750675094943 | 0.366 |
| 0.31537093683284617 | 0.366 |
| 0.31430406328136623 | 0.366 |
| 0.31453545375364295 | 0.367 |
| 0.31453545375364295 | 0.367 |
| 0.31453545375364295 | 0.368 |
| 0.31584061513823036 | 0.369 |
| 0.3166750675094943 | 0.37 |
| 0.31672719034980495 | 0.37 |
| 0.316771873273665 | 0.371 |
| 0.3166750675094943 | 0.372 |
| 0.316771873273665 | 0.372 |
| 0.31663038025976364 | 0.373 |
| 0.3168165542010505 | 0.373 |
| 0.3174194636215948 | 0.374 |
| 0.31890671240061896 | 0.375 |
| 0.31904788371844095 | 0.376 |
| 0.31876552115064194 | 0.376 |
| 0.31700269348805254 | 0.376 |
| 0.31663038025976364 | 0.377 |
| 0.31672719034980495 | 0.377 |
| 0.3168165542010505 | 0.378 |
| 0.31663038025976364 | 0.378 |
| 0.3188175351472111 | 0.38 |
| 0.3191890351097352 | 0.38 |
| 0.31913704043327734 | 0.381 |
| 0.31895129804528166 | 0.382 |
| 0.3188175351472111 | 0.382 |
| 0.3192336081689152 | 0.383 |
| 0.3194192981322228 | 0.383 |
| 0.3211333881401476 | 0.385 |
| 0.3211333881401476 | 0.385 |
| 0.32099251094966347 | 0.386 |
| 0.3230739679970481 | 0.387 |
| 0.32275571830711147 | 0.388 |
| 0.3211778746196906 | 0.388 |
| 0.32090351951645885 | 0.388 |
| 0.3211333881401476 | 0.389 |
| 0.32140762190364525 | 0.39 |
| 0.3217337595607542 | 0.39 |
| 0.3232589462774656 | 0.391 |
| 0.3220152271149705 | 0.392 |
| 0.3212223591202748 | 0.392 |
| 0.3212223591202748 | 0.392 |
| 0.32090351951645885 | 0.393 |
| 0.3210888996814697 | 0.394 |
| 0.32238554125194013 | 0.395 |
| 0.3233551168083115 | 0.396 |
| 0.32552025648972627 | 0.397 |
| 0.3256604973106111 | 0.398 |
| 0.3256604973106111 | 0.398 |
| 0.3246931555004859 | 0.399 |
| 0.3233107270833912 | 0.399 |
| 0.32533569606855334 | 0.4 |
| 0.32543166709408594 | 0.401 |
| 0.32557192033849935 | 0.401 |
| 0.3270470446155058 | 0.403 |
| 0.3274155004218709 | 0.403 |
| 0.3258892171464957 | 0.403 |
| 0.3258892171464957 | 0.404 |
| 0.3256604973106111 | 0.405 |
| 0.3257047828546355 | 0.405 |
| 0.3257047828546355 | 0.406 |
| 0.3276438771791617 | 0.407 |
| 0.3280120552788901 | 0.408 |
| 0.32777646471312155 | 0.408 |
| 0.329020332397931 | 0.41 |
| 0.3298953045398764 | 0.411 |
| 0.32805623680753815 | 0.41 |
| 0.3283802136433652 | 0.411 |
| 0.3301231157335804 | 0.413 |
| 0.3300349331833937 | 0.413 |
| 0.3301231157335804 | 0.414 |
| 0.33222961367349557 | 0.415 |
| 0.33173093861841585 | 0.416 |
| 0.3301231157335804 | 0.416 |
| 0.3316355702690564 | 0.417 |
| 0.33204628750247933 | 0.418 |
| 0.3325082004906344 | 0.418 |
| 0.33246421522367403 | 0.419 |
| 0.33465363403442383 | 0.421 |
| 0.33324096518236024 | 0.421 |
| 0.3322809897197858 | 0.421 |
| 0.3344268527258235 | 0.423 |
| 0.3347925999031119 | 0.423 |
| 0.3347048281781012 | 0.424 |
| 0.3345659076387866 | 0.425 |
| 0.3345220127895525 | 0.425 |
| 0.3347925999031119 | 0.426 |
| 0.3347048281781012 | 0.426 |
| 0.3346098005613477 | 0.427 |
| 0.3349754233398603 | 0.428 |
| 0.3346098005613477 | 0.428 |
| 0.3365317203825656 | 0.43 |
| 0.33680176431456743 | 0.431 |
| 0.33680176431456743 | 0.431 |
| 0.33675802490249723 | 0.432 |
| 0.3365317203825656 | 0.432 |
| 0.3368455592106207 | 0.433 |
| 0.3368455592106207 | 0.434 |
| 0.3384863988412932 | 0.435 |
| 0.33876319099561614 | 0.436 |
| 0.3384863988412932 | 0.437 |
| 0.3386247758476907 | 0.437 |
| 0.33876319099561614 | 0.438 |
| 0.338668490979616 | 0.438 |
| 0.3396733547003734 | 0.44 |
| 0.3407135739312288 | 0.441 |
| 0.340895261006557 | 0.442 |
| 0.3411714444503608 | 0.442 |
| 0.3425294175067851 | 0.444 |
| 0.3415347335589457 | 0.444 |
| 0.3406699481109685 | 0.444 |
| 0.3407135739312288 | 0.445 |
| 0.3409897503919624 | 0.446 |
| 0.3408516431119972 | 0.446 |
| 0.3428052071103407 | 0.448 |
| 0.3449286288432879 | 0.449 |
| 0.34311708354362747 | 0.449 |
| 0.34325487832543855 | 0.45 |
| 0.34497206927418056 | 0.451 |
| 0.34375513733136787 | 0.452 |
| 0.34262380968145845 | 0.452 |
| 0.34479106451851105 | 0.453 |
| 0.34502279483328935 | 0.454 |
| 0.3451096087031259 | 0.455 |
| 0.3458766019376237 | 0.456 |
| 0.3466502256725872 | 0.457 |
| 0.3453339805269962 | 0.457 |
| 0.34515304127305774 | 0.457 |
| 0.34669359138253136 | 0.459 |
| 0.3466502256725872 | 0.46 |
| 0.3468308374274821 | 0.46 |
| 0.34916930679043473 | 0.462 |
| 0.3487655638154368 | 0.463 |
| 0.3467803171610731 | 0.463 |
| 0.34790695484078205 | 0.464 |
| 0.34912604831117794 | 0.465 |
| 0.349486459580726 | 0.466 |
| 0.34970985161801793 | 0.467 |
| 0.35128651348117035 | 0.468 |
| 0.35178277167411454 | 0.469 |
| 0.3511929920839525 | 0.469 |
| 0.35146634644517294 | 0.47 |
| 0.35124334649414374 | 0.471 |
| 0.35128651348117035 | 0.472 |
| 0.3522284814199794 | 0.473 |
| 0.3532198178720814 | 0.474 |
| 0.3533059230657485 | 0.475 |
| 0.3534423211020767 | 0.475 |
| 0.3554144553228738 | 0.477 |
| 0.35446832303768816 | 0.477 |
| 0.35316950642245803 | 0.477 |
| 0.3550561182700513 | 0.479 |
| 0.3554573862959041 | 0.48 |
| 0.3554144553228738 | 0.481 |
| 0.35563647082853517 | 0.481 |
| 0.3554144553228738 | 0.482 |
| 0.3555433553807757 | 0.483 |
| 0.35550037176217536 | 0.484 |
| 0.3555433553807757 | 0.484 |
| 0.3554573862959041 | 0.485 |
| 0.3553642541703383 | 0.486 |
| 0.35755419554738826 | 0.488 |
| 0.35769001539606027 | 0.488 |
| 0.35782581680020564 | 0.489 |
| 0.3579615997648342 | 0.49 |
| 0.3576042306675556 | 0.49 |
| 0.3577829311802789 | 0.491 |
| 0.3576042306675556 | 0.492 |
| 0.35773290500083793 | 0.493 |
| 0.3587188023893885 | 0.494 |
| 0.35969654792545147 | 0.495 |
| 0.3599675879714824 | 0.496 |
| 0.35956812603090743 | 0.497 |
| 0.35969654792545147 | 0.497 |
| 0.3599675879714824 | 0.498 |
| 0.3596109351615796 | 0.499 |
| 0.3597892774666842 | 0.5 |
| 0.3598320771313054 | 0.5 |
| 0.3617916063865524 | 0.502 |
| 0.361969560244018 | 0.503 |
| 0.3617488905087995 | 0.503 |
| 0.361969560244018 | 0.504 |
| 0.361969560244018 | 0.505 |
| 0.3618770326685095 | 0.506 |
| 0.36219018129484726 | 0.507 |
| 0.3616990623431778 | 0.507 |
| 0.36201226669691067 | 0.508 |
| 0.3619268519672062 | 0.509 |
| 0.3618770326685095 | 0.51 |
| 0.36303661888210276 | 0.511 |
| 0.36405277324056956 | 0.512 |
| 0.3659189829573358 | 0.514 |
| 0.3660962039108241 | 0.515 |
| 0.3661387344962717 | 0.516 |
| 0.3660536715164487 | 0.516 |
| 0.3658764430245006 | 0.517 |
| 0.3661812632729456 | 0.518 |
| 0.3659189829573358 | 0.519 |
| 0.3660962039108241 | 0.519 |
| 0.3661387344962717 | 0.52 |
| 0.365961521080602 | 0.521 |
| 0.366315916512911 | 0.522 |
| 0.3659189829573358 | 0.522 |
| 0.36600405739445313 | 0.523 |
| 0.36645055162382273 | 0.524 |
| 0.3659189829573358 | 0.525 |
| 0.3675127863477901 | 0.526 |
| 0.3679939932040364 | 0.527 |
| 0.3679939932040364 | 0.528 |
| 0.36790908789843874 | 0.529 |
| 0.3678666325421452 | 0.53 |
| 0.3682203535736583 | 0.531 |
| 0.36768972509585873 | 0.531 |
| 0.3678171082893574 | 0.532 |
| 0.36808595654549936 | 0.533 |
| 0.36777464902777424 | 0.534 |
| 0.3678666325421452 | 0.534 |
| 0.3678666325421452 | 0.535 |
| 0.36790908789843874 | 0.536 |
| 0.3678666325421452 | 0.537 |
| 0.3678666325421452 | 0.538 |
| 0.36804350869772273 | 0.539 |
| 0.36808595654549936 | 0.539 |
| 0.3679939932040364 | 0.54 |
| 0.36808595654549936 | 0.541 |
| 0.36777464902777424 | 0.542 |
| 0.36998702885731743 | 0.544 |
| 0.36998702885731743 | 0.544 |
| 0.3679939932040364 | 0.544 |
| 0.3691040535706133 | 0.546 |
| 0.37024824451092253 | 0.547 |
| 0.3704670468481957 | 0.548 |
| 0.3703823512674283 | 0.549 |
| 0.37042469995447985 | 0.55 |
| 0.370777517459486 | 0.55 |
| 0.370205888350397 | 0.551 |
| 0.3705093919487281 | 0.552 |
| 0.37024824451092253 | 0.553 |
| 0.3703823512674283 | 0.553 |
| 0.3705587830507925 | 0.554 |
| 0.3701635303957515 | 0.555 |
| 0.37060112426700675 | 0.556 |
| 0.37024824451092253 | 0.556 |
| 0.3702905988774792 | 0.557 |
| 0.3703823512674283 | 0.558 |
| 0.3701635303957515 | 0.559 |
| 0.3717928792877776 | 0.56 |
| 0.3722297609020827 | 0.561 |
| 0.3722297609020827 | 0.561 |
| 0.37240586707323114 | 0.562 |
| 0.372095901683551 | 0.562 |
| 0.3709538795428941 | 0.562 |
| 0.3701635303957515 | 0.562 |
| 0.37042469995447985 | 0.563 |
| 0.37024824451092253 | 0.563 |
| 0.37024824451092253 | 0.564 |
| 0.3718774554923185 | 0.566 |
| 0.3720536237120883 | 0.567 |
| 0.3722297609020827 | 0.567 |
| 0.37249742559626503 | 0.568 |
| 0.3720536237120883 | 0.569 |
| 0.37249742559626503 | 0.57 |
| 0.37232133554981905 | 0.571 |
| 0.3742495456654332 | 0.572 |
| 0.37473454083991287 | 0.574 |
| 0.3741229792783606 | 0.574 |
| 0.37600561068921623 | 0.576 |
| 0.3760547310782773 | 0.577 |
| 0.37455884432145475 | 0.577 |
| 0.37447449460438265 | 0.578 |
| 0.37416516985397086 | 0.578 |
| 0.37473454083991287 | 0.58 |
| 0.37416516985397086 | 0.58 |
| 0.3761810532219305 | 0.582 |
| 0.3758301373710185 | 0.582 |
| 0.3742495456654332 | 0.582 |
| 0.3746010165120628 | 0.583 |
| 0.37416516985397086 | 0.584 |
| 0.37434093554719944 | 0.585 |
| 0.3752613900216905 | 0.586 |
| 0.3761389476137195 | 0.588 |
| 0.3750857860525453 | 0.588 |
| 0.37442529653021744 | 0.589 |
| 0.37627226676185743 | 0.591 |
| 0.3763564649799618 | 0.592 |
| 0.3761389476137195 | 0.593 |
| 0.37500148077302353 | 0.593 |
| 0.374516670352278 | 0.593 |
| 0.3761810532219305 | 0.595 |
| 0.3765318459741043 | 0.596 |
| 0.37609684023255147 | 0.597 |
| 0.37627226676185743 | 0.598 |
| 0.3761810532219305 | 0.599 |
| 0.3762301649941537 | 0.6 |
| 0.37644766252209383 | 0.601 |
| 0.37609684023255147 | 0.602 |
| 0.3764897551339559 | 0.603 |
| 0.3763564649799618 | 0.604 |
| 0.37627226676185743 | 0.605 |
| 0.3762301649941537 | 0.605 |
| 0.37609684023255147 | 0.606 |
| 0.3765318459741043 | 0.607 |
| 0.3762301649941537 | 0.608 |
| 0.3762301649941537 | 0.609 |
| 0.37679836177851916 | 0.61 |
| 0.378199875125159 | 0.612 |
| 0.37841694471410503 | 0.613 |
| 0.3782418940479438 | 0.614 |
| 0.3781508599960514 | 0.615 |
| 0.3785919647428935 | 0.616 |
| 0.3781508599960514 | 0.617 |
| 0.3783749331462714 | 0.618 |
| 0.378199875125159 | 0.619 |
| 0.3782418940479438 | 0.62 |
| 0.37854996052743684 | 0.621 |
| 0.3781508599960514 | 0.621 |
| 0.37828391120521276 | 0.622 |
| 0.37810883724785915 | 0.623 |
| 0.3782418940479438 | 0.624 |
| 0.3783749331462714 | 0.625 |
| 0.37810883724785915 | 0.626 |
| 0.3798581440781961 | 0.628 |
| 0.3802915170580505 | 0.629 |
| 0.3803404273773628 | 0.63 |
| 0.3805989528609945 | 0.631 |
| 0.38020764952715086 | 0.632 |
| 0.3804662093350822 | 0.633 |
| 0.3802915170580505 | 0.634 |
| 0.3803404273773628 | 0.635 |
| 0.3802915170580505 | 0.636 |
| 0.38016571312389275 | 0.636 |
| 0.3819114286806856 | 0.639 |
| 0.3821276941844653 | 0.64 |
| 0.3805151111110945 | 0.64 |
| 0.3805151111110945 | 0.641 |
| 0.38024958417182114 | 0.641 |
| 0.3804242837737179 | 0.642 |
| 0.3804242837737179 | 0.643 |
| 0.38234391292758924 | 0.645 |
| 0.3827343813896929 | 0.647 |
| 0.3822602173567418 | 0.647 |
| 0.3828668241915627 | 0.649 |
| 0.38234391292758924 | 0.649 |
| 0.3823857580863037 | 0.65 |
| 0.38317346939272795 | 0.652 |
| 0.3846078348362216 | 0.654 |
| 0.38503915475185646 | 0.655 |
| 0.38464958536989446 | 0.656 |
| 0.38464958536989446 | 0.657 |
| 0.38503915475185646 | 0.658 |
| 0.3846078348362216 | 0.658 |
| 0.38495568446649114 | 0.66 |
| 0.3847400297613329 | 0.66 |
| 0.3826925508169382 | 0.66 |
| 0.3829574299602522 | 0.661 |
| 0.3821695483916764 | 0.662 |
| 0.3830410123944083 | 0.663 |
| 0.38234391292758924 | 0.664 |
| 0.38073167876840197 | 0.664 |
| 0.3805989528609945 | 0.665 |
| 0.38020764952715086 | 0.665 |
| 0.3790258866790893 | 0.666 |
| 0.3781508599960514 | 0.666 |
| 0.3783749331462714 | 0.667 |
| 0.37907485893846027 | 0.668 |
| 0.38024958417182114 | 0.67 |
| 0.3803404273773628 | 0.671 |
| 0.3803404273773628 | 0.672 |
| 0.3803404273773628 | 0.673 |
| 0.3803404273773628 | 0.674 |
| 0.38020764952715086 | 0.675 |
| 0.3805989528609945 | 0.676 |
| 0.3805151111110945 | 0.677 |
| 0.382302066017784 | 0.68 |
| 0.3826507184943138 | 0.681 |
| 0.38234391292758924 | 0.681 |
| 0.3827343813896929 | 0.683 |
| 0.3823857580863037 | 0.684 |
| 0.3825182470658109 | 0.685 |
| 0.38247640745086753 | 0.686 |
| 0.38234391292758924 | 0.687 |
| 0.3828668241915627 | 0.688 |
| 0.382302066017784 | 0.689 |
| 0.3825182470658109 | 0.69 |
| 0.3827343813896929 | 0.691 |
| 0.3822602173567418 | 0.692 |
| 0.38243456608529736 | 0.693 |
| 0.38234391292758924 | 0.694 |
| 0.3823857580863037 | 0.695 |
| 0.3832152250573257 | 0.696 |
| 0.3846078348362216 | 0.698 |
| 0.3850877787248795 | 0.7 |
| 0.3848652595785902 | 0.701 |
| 0.384691334160533 | 0.701 |
| 0.38464958536989446 | 0.702 |
| 0.38247640745086753 | 0.702 |
| 0.38377946789786566 | 0.704 |
| 0.38478177477627695 | 0.706 |
| 0.3848235180486476 | 0.707 |
| 0.3849974204800848 | 0.708 |
| 0.38464958536989446 | 0.709 |
| 0.3862555203633468 | 0.711 |
| 0.3872969353599122 | 0.712 |
| 0.3872969353599122 | 0.713 |
| 0.3874704082268362 | 0.715 |
| 0.3872969353599122 | 0.716 |
| 0.38877395668990306 | 0.718 |
| 0.38968122761824414 | 0.72 |
| 0.39145189235357625 | 0.722 |
| 0.3917075615059374 | 0.723 |
| 0.39141042486197786 | 0.724 |
| 0.39270195735234137 | 0.726 |
| 0.3933022107552139 | 0.728 |
| 0.3935642948426396 | 0.729 |
| 0.39347464508109375 | 0.73 |
| 0.39326081992232254 | 0.731 |
| 0.39364704967850306 | 0.732 |
| 0.39347464508109375 | 0.733 |
| 0.3935229148564299 | 0.734 |
| 0.3935229148564299 | 0.735 |
| 0.39326081992232254 | 0.736 |
| 0.39364704967850306 | 0.738 |
| 0.3935229148564299 | 0.739 |
| 0.39347464508109375 | 0.74 |
| 0.39399176972890015 | 0.741 |
| 0.39519730081966953 | 0.743 |
| 0.3955414869733155 | 0.744 |
| 0.39536940870450604 | 0.745 |
| 0.3954176412405546 | 0.746 |
| 0.3958855547036115 | 0.748 |
| 0.3971781326618966 | 0.75 |
| 0.39773455395609275 | 0.751 |
| 0.3973911219281399 | 0.752 |
| 0.3990590489185985 | 0.755 |
| 0.3992784862512052 | 0.756 |
| 0.3971781326618966 | 0.755 |
| 0.3965733352199232 | 0.756 |
| 0.39532810334804785 | 0.756 |
| 0.39536940870450604 | 0.758 |
| 0.3959268370412343 | 0.759 |
| 0.39708886035113605 | 0.761 |
| 0.397562852685311 | 0.763 |
| 0.3971781326618966 | 0.763 |
| 0.39571353563628875 | 0.763 |
| 0.3955001887241468 | 0.764 |
| 0.39532810334804785 | 0.766 |
| 0.396614589174706 | 0.768 |
| 0.3972605889872431 | 0.769 |
| 0.3990590489185985 | 0.772 |
| 0.39979261905159574 | 0.773 |
| 0.3994019087025528 | 0.774 |
| 0.3995321624479229 | 0.775 |
| 0.39931962876091115 | 0.776 |
| 0.3976040658396159 | 0.776 |
| 0.3976040658396159 | 0.777 |
| 0.3971781326618966 | 0.778 |
| 0.39880525266060957 | 0.781 |
| 0.3993607695779804 | 0.782 |
| 0.3993607695779804 | 0.783 |
| 0.3995321624479229 | 0.785 |
| 0.3972605889872431 | 0.784 |
| 0.397906225750609 | 0.786 |
| 0.3973018146004143 | 0.786 |
| 0.397562852685311 | 0.788 |
| 0.39803667444733554 | 0.789 |
| 0.3992304935046796 | 0.792 |
| 0.3995732945222918 | 0.793 |
| 0.3995732945222918 | 0.794 |
| 0.3994498932232947 | 0.795 |
| 0.3997035259473834 | 0.797 |
| 0.3993607695779804 | 0.798 |
| 0.40055990323952534 | 0.8 |
| 0.4014154939690426 | 0.802 |
| 0.40128548531973285 | 0.803 |
| 0.4014154939690426 | 0.804 |
| 0.40124442361251095 | 0.805 |
| 0.4006009930633669 | 0.806 |
| 0.3994019087025528 | 0.806 |
| 0.4009911814589933 | 0.808 |
| 0.40196956314514254 | 0.81 |
| 0.4031655207451012 | 0.813 |
| 0.4035069757117549 | 0.814 |
| 0.4031655207451012 | 0.815 |
| 0.4017165045841856 | 0.815 |
| 0.4014565486525686 | 0.816 |
| 0.40124442361251095 | 0.817 |
| 0.4015454857183007 | 0.819 |
| 0.4014565486525686 | 0.82 |
| 0.40295375794958244 | 0.822 |
| 0.40367765948322193 | 0.824 |
| 0.4055123202841131 | 0.827 |
| 0.405934719152681 | 0.828 |
| 0.40555320712122295 | 0.83 |
| 0.40363669588737067 | 0.829 |
| 0.40363669588737067 | 0.83 |
| 0.4030357394301944 | 0.831 |
| 0.4046602290816424 | 0.834 |
| 0.40568266214789184 | 0.836 |
| 0.4057235420209972 | 0.837 |
| 0.405253349354457 | 0.838 |
| 0.40320650364613264 | 0.837 |
| 0.40261216774311315 | 0.838 |
| 0.4014565486525686 | 0.839 |
| 0.4014565486525686 | 0.84 |
| 0.40201742461920326 | 0.842 |
| 0.4054237353337808 | 0.846 |
| 0.40576442022300724 | 0.847 |
| 0.40559409228666815 | 0.848 |
| 0.40568266214789184 | 0.85 |
| 0.4057235420209972 | 0.851 |
| 0.40559409228666815 | 0.852 |
| 0.40657472805068773 | 0.854 |
| 0.407595260016462 | 0.857 |
| 0.4107318681514243 | 0.86 |
| 0.4114095165201792 | 0.862 |
| 0.4111588358783036 | 0.863 |
| 0.41086065455035137 | 0.864 |
| 0.4097145871691755 | 0.865 |
| 0.40810513570782037 | 0.865 |
| 0.40810513570782037 | 0.866 |
| 0.4095042068363029 | 0.869 |
| 0.4097553025528805 | 0.87 |
| 0.4096331514282005 | 0.871 |
| 0.4096331514282005 | 0.872 |
| 0.4098842147734947 | 0.874 |
| 0.4095856530782256 | 0.875 |
| 0.4098842147734947 | 0.877 |
| 0.4096331514282005 | 0.878 |
| 0.41107074973671465 | 0.88 |
| 0.411619496437027 | 0.882 |
| 0.4131015779459233 | 0.885 |
| 0.4132706320434508 | 0.886 |
| 0.4133112029014837 | 0.888 |
| 0.41178880125104306 | 0.888 |
| 0.4111994925025056 | 0.888 |
| 0.4095856530782256 | 0.888 |
| 0.4097553025528805 | 0.89 |
| 0.4097145871691755 | 0.891 |
| 0.4097553025528805 | 0.892 |
| 0.4097553025528805 | 0.893 |
| 0.4095042068363029 | 0.895 |
| 0.41005381360916954 | 0.897 |
| 0.40954493078645043 | 0.897 |
| 0.4096738701276605 | 0.899 |
| 0.4098842147734947 | 0.901 |
| 0.4111114099422867 | 0.903 |
| 0.41242512883678134 | 0.906 |
| 0.41335177211358853 | 0.908 |
| 0.4132706320434508 | 0.909 |
| 0.41377762292791676 | 0.911 |
| 0.4149123039099106 | 0.913 |
| 0.4150810521995716 | 0.915 |
| 0.4150405530837921 | 0.916 |
| 0.4150405530837921 | 0.917 |
| 0.41541846337495636 | 0.919 |
| 0.4150405530837921 | 0.92 |
| 0.41567481550571966 | 0.922 |
| 0.4152497720180516 | 0.923 |
| 0.41541846337495636 | 0.925 |
| 0.41516878581193245 | 0.926 |
| 0.4150405530837921 | 0.927 |
| 0.41512829024920295 | 0.929 |
| 0.4152092797348375 | 0.93 |
| 0.4150405530837921 | 0.931 |
| 0.41516878581193245 | 0.933 |
| 0.41500005232776815 | 0.934 |
| 0.4150405530837921 | 0.936 |
| 0.41516878581193245 | 0.937 |
| 0.4152092797348375 | 0.939 |
| 0.415587126279887 | 0.941 |
| 0.4150405530837921 | 0.941 |
| 0.4157152889430957 | 0.943 |
| 0.4150810521995716 | 0.944 |
| 0.4152092797348375 | 0.946 |
| 0.4152092797348375 | 0.947 |
| 0.41500005232776815 | 0.948 |
| 0.4152092797348375 | 0.95 |
| 0.41512829024920295 | 0.951 |
| 0.4150405530837921 | 0.953 |
| 0.41512829024920295 | 0.954 |
| 0.41500005232776815 | 0.956 |
| 0.41554664765488986 | 0.958 |
| 0.4152970020985483 | 0.959 |
| 0.4167669177762624 | 0.962 |
| 0.41731927428045373 | 0.964 |
| 0.4169353534193698 | 0.965 |
| 0.41731927428045373 | 0.967 |
| 0.41715090329633475 | 0.968 |
| 0.41719131703664125 | 0.969 |
| 0.41740008652083005 | 0.971 |
| 0.41916272024706347 | 0.974 |
| 0.4193777906012423 | 0.976 |
| 0.4193777906012423 | 0.978 |
| 0.4207209201625298 | 0.98 |
| 0.42143207813612277 | 0.983 |
| 0.41925009650538275 | 0.982 |
| 0.4196264196090732 | 0.984 |
| 0.41929042550013035 | 0.985 |
| 0.41933075286851584 | 0.986 |
| 0.4197943743385098 | 0.988 |
| 0.4212174491921611 | 0.991 |
| 0.4205933974721857 | 0.992 |
| 0.41929042550013035 | 0.992 |
| 0.4193777906012423 | 0.994 |
| 0.41958610416262726 | 0.996 |
| 0.41920976588414166 | 0.997 |
| 0.41966673343024946 | 0.999 |
| 0.4193777906012423 | 1 |
| 0.42109669027205715 | 1.004 |
| 0.4217673535528813 | 1.006 |
| 0.42138513693550583 | 1.007 |
| 0.4215527965643857 | 1.008 |
| 0.42151255870749177 | 1.01 |
| 0.4213046461080936 | 1.011 |
| 0.42180758115888894 | 1.013 |
| 0.42143207813612277 | 1.014 |
| 0.42151255870749177 | 1.016 |
| 0.4214723192314475 | 1.018 |
| 0.4216399642452381 | 1.019 |
| 0.42151255870749177 | 1.021 |
| 0.41925009650538275 | 1.02 |
| 0.4196264196090732 | 1.022 |
| 0.41933075286851584 | 1.023 |
| 0.4209289541487083 | 1.026 |
| 0.4219348964019087 | 1.029 |
| 0.42322779598187593 | 1.032 |
| 0.42368961463126126 | 1.034 |
| 0.4233549831900887 | 1.035 |
| 0.4233549831900887 | 1.037 |
| 0.423729764985133 | 1.039 |
| 0.4253209567777134 | 1.042 |
| 0.4254879578803667 | 1.044 |
| 0.42540112499020916 | 1.046 |
| 0.4267361941307197 | 1.049 |
| 0.4271963957474284 | 1.051 |
| 0.42544120668648233 | 1.05 |
| 0.4250670658799723 | 1.052 |
| 0.42348215422377256 | 1.052 |
| 0.42322779598187593 | 1.053 |
| 0.4238568883693878 | 1.055 |
| 0.4253209567777134 | 1.058 |
| 0.4254879578803667 | 1.06 |
| 0.4254879578803667 | 1.062 |
| 0.42544120668648233 | 1.063 |
| 0.4255680601823422 | 1.065 |
| 0.42540112499020916 | 1.067 |
| 0.4262757806309705 | 1.069 |
| 0.42702967973596756 | 1.072 |
| 0.4271497243587274 | 1.073 |
| 0.42756968846190185 | 1.075 |
| 0.4291082590097006 | 1.079 |
| 0.4285290718224713 | 1.08 |
| 0.4269830005655683 | 1.08 |
| 0.4258619412765754 | 1.08 |
| 0.42565493109830826 | 1.081 |
| 0.4253610416873291 | 1.083 |
| 0.4262757806309705 | 1.085 |
| 0.4271497243587274 | 1.088 |
| 0.4269830005655683 | 1.09 |
| 0.4272364055521955 | 1.092 |
| 0.4255280360964512 | 1.091 |
| 0.42565493109830826 | 1.093 |
| 0.42544120668648233 | 1.095 |
| 0.42644262236638447 | 1.097 |
| 0.4272364055521955 | 1.1 |
| 0.4289818014897849 | 1.104 |
| 0.4292347005401339 | 1.106 |
| 0.4291481923957936 | 1.107 |
| 0.42781628929604376 | 1.108 |
| 0.4273164203596968 | 1.109 |
| 0.4269029590740306 | 1.11 |
| 0.42810945812647416 | 1.113 |
| 0.4292347005401339 | 1.116 |
| 0.4292746288774084 | 1.118 |
| 0.4292746288774084 | 1.119 |
| 0.42919477060852373 | 1.121 |
| 0.42952740157574504 | 1.123 |
| 0.4292347005401339 | 1.125 |
| 0.4290283874531704 | 1.126 |
| 0.42944097107078755 | 1.128 |
| 0.430810528251428 | 1.132 |
| 0.43130870629714674 | 1.134 |
| 0.43110282070529804 | 1.135 |
| 0.4311824745220181 | 1.137 |
| 0.4313485519102847 | 1.139 |
| 0.4293145556204745 | 1.139 |
| 0.4292347005401339 | 1.14 |
| 0.4292347005401339 | 1.142 |
| 0.43035198724309176 | 1.145 |
| 0.4316008009867763 | 1.148 |
| 0.4329276763460906 | 1.152 |
| 0.433212678868444 | 1.154 |
| 0.4330934120423493 | 1.156 |
| 0.43168046735284815 | 1.156 |
| 0.4313485519102847 | 1.157 |
| 0.43114267452275457 | 1.159 |
| 0.43126885909627294 | 1.161 |
| 0.43114267452275457 | 1.162 |
| 0.43239050185113104 | 1.165 |
| 0.43313318660762523 | 1.168 |
| 0.4311824745220181 | 1.168 |
| 0.43060454005577753 | 1.169 |
| 0.4292746288774084 | 1.169 |
| 0.43047827162229996 | 1.172 |
| 0.4313950277492537 | 1.175 |
| 0.43284148709880016 | 1.179 |
| 0.43400110835803246 | 1.182 |
| 0.4349146420569171 | 1.185 |
| 0.4337096619486012 | 1.185 |
| 0.43317290746487536 | 1.187 |
| 0.43296745750384696 | 1.188 |
| 0.43313318660762523 | 1.19 |
| 0.433212678868444 | 1.192 |
| 0.43441825761939273 | 1.195 |
| 0.4350800487961853 | 1.198 |
| 0.4348683295112305 | 1.199 |
| 0.43449769985373743 | 1.201 |
| 0.43313318660762523 | 1.201 |
| 0.43300723707912564 | 1.203 |
| 0.43317290746487536 | 1.205 |
| 0.43300723707912564 | 1.207 |
| 0.43383552304364953 | 1.21 |
| 0.43499404486872384 | 1.213 |
| 0.43503374391044974 | 1.215 |
| 0.43503374391044974 | 1.217 |
| 0.4349146420569171 | 1.219 |
| 0.43503374391044974 | 1.221 |
| 0.4349146420569171 | 1.222 |
| 0.43615117410290816 | 1.226 |
| 0.4373069659364244 | 1.229 |
| 0.43862629646493456 | 1.233 |
| 0.4390744788394849 | 1.235 |
| 0.438751540304382 | 1.237 |
| 0.4375511774943984 | 1.237 |
| 0.43685144676716 | 1.238 |
| 0.43499404486872384 | 1.238 |
| 0.43549014364754934 | 1.24 |
| 0.436772191307243 | 1.244 |
| 0.4369372911058759 | 1.246 |
| 0.43685144676716 | 1.248 |
| 0.436772191307243 | 1.25 |
| 0.4366466993054533 | 1.252 |
| 0.43499404486872384 | 1.251 |
| 0.4349543442509214 | 1.253 |
| 0.43511969239915954 | 1.256 |
| 0.4364815515192389 | 1.259 |
| 0.4375511774943984 | 1.263 |
| 0.43879109045998427 | 1.266 |
| 0.438751540304382 | 1.268 |
| 0.4389558573024477 | 1.27 |
| 0.4369372911058759 | 1.27 |
| 0.4373861790255411 | 1.272 |
| 0.438751540304382 | 1.276 |
| 0.43903493989057074 | 1.278 |
| 0.4388306390514337 | 1.28 |
| 0.43862629646493456 | 1.282 |
| 0.4388306390514337 | 1.284 |
| 0.43879109045998427 | 1.286 |
| 0.43870540511884576 | 1.288 |
| 0.438870186078854 | 1.29 |
| 0.4386658515741627 | 1.292 |
| 0.438870186078854 | 1.294 |
| 0.43879109045998427 | 1.296 |
| 0.4388306390514337 | 1.298 |
| 0.4388306390514337 | 1.3 |
| 0.43870540511884576 | 1.302 |
| 0.4389558573024477 | 1.304 |
| 0.43879109045998427 | 1.306 |
| 0.43870540511884576 | 1.308 |
| 0.43891631366299155 | 1.311 |
| 0.44022689881825067 | 1.314 |
| 0.44088480656554657 | 1.317 |
| 0.44047697027778365 | 1.319 |
| 0.44072035726973313 | 1.321 |
| 0.4406414595999956 | 1.323 |
| 0.44047697027778365 | 1.325 |
| 0.44137799225379726 | 1.328 |
| 0.4426131722931429 | 1.332 |
| 0.4423636345331754 | 1.333 |
| 0.4427773106367834 | 1.336 |
| 0.4426131722931429 | 1.338 |
| 0.4428560399793094 | 1.34 |
| 0.44252781383727874 | 1.342 |
| 0.4424884111967958 | 1.344 |
| 0.4428560399793094 | 1.347 |
| 0.44437128791941377 | 1.351 |
| 0.4443319578511927 | 1.353 |
| 0.44265251838384 | 1.353 |
| 0.4424884111967958 | 1.355 |
| 0.44265251838384 | 1.357 |
| 0.4423636345331754 | 1.359 |
| 0.44338762345561783 | 1.362 |
| 0.44458095344954535 | 1.366 |
| 0.44482339527532266 | 1.369 |
| 0.4447840829848453 | 1.371 |
| 0.44458095344954535 | 1.373 |
| 0.4450264755744961 | 1.375 |
| 0.4446595924567596 | 1.377 |
| 0.44453513796601174 | 1.379 |
| 0.44486270602040473 | 1.382 |
| 0.44453513796601174 | 1.383 |
| 0.44506577833730787 | 1.386 |
| 0.44637491870816604 | 1.39 |
| 0.44637491870816604 | 1.392 |
| 0.4467868876829057 | 1.395 |
| 0.44662340620065066 | 1.397 |
| 0.4464991958906804 | 1.399 |
| 0.44662340620065066 | 1.402 |
| 0.44760389444140225 | 1.405 |
| 0.4487008559908095 | 1.409 |
| 0.44695034244333426 | 1.409 |
| 0.44695034244333426 | 1.411 |
| 0.4485833709376191 | 1.416 |
| 0.4484202342447249 | 1.418 |
| 0.4487465323418457 | 1.42 |
| 0.45053950172599666 | 1.425 |
| 0.4508195806867369 | 1.428 |
| 0.4507414246248162 | 1.43 |
| 0.44988791737295475 | 1.431 |
| 0.4486225341556735 | 1.431 |
| 0.4483744916471438 | 1.433 |
| 0.4488248444661987 | 1.436 |
| 0.4485833709376191 | 1.438 |
| 0.44984229312766916 | 1.442 |
| 0.45106701752503564 | 1.446 |
| 0.4508195806867369 | 1.448 |
| 0.4505785884120493 | 1.45 |
| 0.4486225341556735 | 1.45 |
| 0.4485833709376191 | 1.452 |
| 0.4487008559908095 | 1.454 |
| 0.4504548684365587 | 1.459 |
| 0.4511842111660041 | 1.463 |
| 0.45244630793959184 | 1.467 |
| 0.4526933426425263 | 1.47 |
| 0.45248532016737375 | 1.472 |
| 0.4523683300529049 | 1.474 |
| 0.45277134630495547 | 1.477 |
| 0.45244630793959184 | 1.478 |
| 0.4536679002984159 | 1.483 |
| 0.4546349786723169 | 1.486 |
| 0.4545571202503179 | 1.489 |
| 0.4541937177878429 | 1.491 |
| 0.45253082398850103 | 1.49 |
| 0.4523683300529049 | 1.492 |
| 0.45273234523431233 | 1.495 |
| 0.45240734532283716 | 1.497 |
| 0.45293382587749326 | 1.501 |
| 0.45447277528978863 | 1.505 |
| 0.45435601747058185 | 1.507 |
| 0.4547193099534946 | 1.51 |
| 0.45273234523431233 | 1.51 |
| 0.4526933426425263 | 1.512 |
| 0.45248532016737375 | 1.514 |
| 0.4536223971194288 | 1.518 |
| 0.4545181887659751 | 1.522 |
| 0.45589278143727163 | 1.526 |
| 0.45662463685066884 | 1.53 |
| 0.456417430652237 | 1.532 |
| 0.4565016117571629 | 1.535 |
| 0.456579318937096 | 1.537 |
| 0.45630084874500065 | 1.539 |
| 0.45670233447162817 | 1.542 |
| 0.45654046610193005 | 1.544 |
| 0.45714895323049354 | 1.548 |
| 0.458442329553549 | 1.552 |
| 0.45799628819617877 | 1.554 |
| 0.45811912955561546 | 1.557 |
| 0.4581579211048077 | 1.559 |
| 0.45795749037636724 | 1.561 |
| 0.4581579211048077 | 1.564 |
| 0.45795749037636724 | 1.566 |
| 0.458442329553549 | 1.57 |
| 0.4600502693485909 | 1.575 |
| 0.4602954329622824 | 1.578 |
| 0.4602954329622824 | 1.58 |
| 0.458280742611862 | 1.579 |
| 0.45803508451077773 | 1.581 |
| 0.4581579211048077 | 1.584 |
| 0.4592886205503308 | 1.588 |
| 0.4603728459049737 | 1.592 |
| 0.4617844538207172 | 1.597 |
| 0.46230607249527 | 1.601 |
| 0.46214510872956743 | 1.603 |
| 0.4612239423025597 | 1.604 |
| 0.46033414018272334 | 1.605 |
| 0.46013414520476176 | 1.608 |
| 0.46077914021111493 | 1.611 |
| 0.46214510872956743 | 1.616 |
| 0.46222880907054703 | 1.619 |
| 0.4623511316318505 | 1.621 |
| 0.4621064715446039 | 1.623 |
| 0.46226744152911303 | 1.626 |
| 0.46222880907054703 | 1.629 |
| 0.46226744152911303 | 1.632 |
| 0.46230607249527 | 1.634 |
| 0.4617844538207172 | 1.636 |
| 0.4623897593651755 | 1.639 |
| 0.46226744152911303 | 1.642 |
| 0.4633099035785917 | 1.646 |
| 0.464113476675491 | 1.65 |
| 0.4623511316318505 | 1.65 |
| 0.4626729669564853 | 1.653 |
| 0.46407491546938884 | 1.658 |
| 0.46407491546938884 | 1.66 |
| 0.46419701243231787 | 1.663 |
| 0.465442802346268 | 1.668 |
| 0.4656032362195573 | 1.671 |
| 0.46419701243231787 | 1.671 |
| 0.464113476675491 | 1.674 |
| 0.46415845444738274 | 1.677 |
| 0.46407491546938884 | 1.679 |
| 0.46419701243231787 | 1.682 |
| 0.464113476675491 | 1.685 |
| 0.46391423619450384 | 1.687 |
| 0.46419701243231787 | 1.69 |
| 0.46391423619450384 | 1.692 |
| 0.46419701243231787 | 1.695 |
| 0.46415845444738274 | 1.698 |
| 0.46471737451502004 | 1.702 |
| 0.4658791283410301 | 1.706 |
| 0.46564173853791385 | 1.709 |
| 0.4658791283410301 | 1.712 |
| 0.465802140500833 | 1.714 |
| 0.4656032362195573 | 1.717 |
| 0.4658791283410301 | 1.72 |
| 0.46571873872762654 | 1.722 |
| 0.4659625167390887 | 1.726 |
| 0.4664819611691567 | 1.729 |
| 0.4665588966912277 | 1.732 |
| 0.4666037646104158 | 1.735 |
| 0.46607797775920584 | 1.737 |
| 0.46584063516182256 | 1.739 |
| 0.4665588966912277 | 1.743 |
| 0.46671915161940336 | 1.746 |
| 0.4667639619448389 | 1.749 |
| 0.46584063516182256 | 1.75 |
| 0.46591762003856996 | 1.753 |
| 0.46652042967007634 | 1.757 |
| 0.46680241959934965 | 1.76 |
| 0.46680241959934965 | 1.763 |
| 0.46652042967007634 | 1.765 |
| 0.4665588966912277 | 1.768 |
| 0.46652042967007634 | 1.771 |
| 0.4661998304139768 | 1.773 |
| 0.46584063516182256 | 1.775 |
| 0.4663986160772937 | 1.779 |
| 0.4666806907624065 | 1.783 |
| 0.46652042967007634 | 1.785 |
| 0.4665588966912277 | 1.788 |
| 0.4666422284261153 | 1.791 |
| 0.4660010052270631 | 1.793 |
| 0.4658791283410301 | 1.795 |
| 0.465802140500833 | 1.798 |
| 0.46555832338526826 | 1.8 |
| 0.465802140500833 | 1.804 |
| 0.4662383097693661 | 1.807 |
| 0.4667639619448389 | 1.811 |
| 0.46652042967007634 | 1.814 |
| 0.4663601428900119 | 1.816 |
| 0.46684087577492595 | 1.82 |
| 0.4666037646104158 | 1.823 |
| 0.46684087577492595 | 1.826 |
| 0.4666806907624065 | 1.828 |
| 0.4664819611691567 | 1.831 |
| 0.46680241959934965 | 1.834 |
| 0.4662383097693661 | 1.836 |
| 0.4666806907624065 | 1.84 |
| 0.4664819611691567 | 1.843 |
| 0.4665588966912277 | 1.846 |
| 0.4666422284261153 | 1.849 |
| 0.4663986160772937 | 1.851 |
| 0.46671915161940336 | 1.855 |
| 0.4666037646104158 | 1.858 |
| 0.4666037646104158 | 1.86 |
| 0.4667639619448389 | 1.864 |
| 0.4664434911883545 | 1.866 |
| 0.46692423441240843 | 1.87 |
| 0.4666806907624065 | 1.872 |
| 0.46700108552455355 | 1.876 |
| 0.468480212602837 | 1.881 |
| 0.46816024113685106 | 1.884 |
| 0.4684034247619677 | 1.887 |
| 0.46844181941944885 | 1.89 |
| 0.46888317661228496 | 1.894 |
| 0.47032120341179234 | 1.9 |
| 0.47151474577627844 | 1.905 |
| 0.4719930577818884 | 1.909 |
| 0.4719930577818884 | 1.912 |
| 0.4717507456374292 | 1.915 |
| 0.47222889467229284 | 1.919 |
| 0.4718719090490557 | 1.921 |
| 0.47211414170424987 | 1.925 |
| 0.4719930577818884 | 1.927 |
| 0.4719930577818884 | 1.931 |
| 0.47211414170424987 | 1.934 |
| 0.47183364586559773 | 1.936 |
| 0.47191017076849845 | 1.939 |
| 0.4702764517529788 | 1.939 |
| 0.47016152473778555 | 1.942 |
| 0.470359524508789 | 1.945 |
| 0.47151474577627844 | 1.951 |
| 0.4722735590432383 | 1.955 |
| 0.4738212424444366 | 1.961 |
| 0.4737448636520373 | 1.964 |
| 0.47394215526228844 | 1.968 |
| 0.4739039712126121 | 1.971 |
| 0.4738657857048584 | 1.974 |
| 0.47394215526228844 | 1.977 |
| 0.4744955851759772 | 1.982 |
| 0.47584935130987766 | 1.987 |
| 0.47549360606418095 | 1.99 |
| 0.47565243565183407 | 1.993 |
| 0.47398033785399873 | 1.993 |
| 0.47318460757182196 | 1.995 |
| 0.47203131486634176 | 1.996 |
| 0.47183364586559773 | 1.998 |
| 0.4721906451460647 | 2.002 |
| 0.4738212424444366 | 2.009 |
| 0.47465457334539674 | 2.014 |
| 0.47584935130987766 | 2.019 |
| 0.4744955851759772 | 2.02 |
| 0.47398033785399873 | 2.022 |
| 0.47398033785399873 | 2.025 |
| 0.474616416489559 | 2.029 |
| 0.4758112400166552 | 2.035 |
| 0.47668099453959795 | 2.04 |
| 0.4775119467135288 | 2.045 |
| 0.4774738987325268 | 2.048 |
| 0.4765223282464966 | 2.049 |
| 0.47584935130987766 | 2.051 |
| 0.47549360606418095 | 2.053 |
| 0.47604617826129175 | 2.058 |
| 0.47739151465702284 | 2.064 |
| 0.477549993246937 | 2.067 |
| 0.4775119467135288 | 2.07 |
| 0.47739151465702284 | 2.073 |
| 0.47731540808184686 | 2.076 |
| 0.4758874611506847 | 2.076 |
| 0.47584935130987766 | 2.08 |
| 0.47584935130987766 | 2.083 |
| 0.4770807179867941 | 2.089 |
| 0.477549993246937 | 2.093 |
| 0.47901993388861913 | 2.099 |
| 0.47782899017005864 | 2.1 |
| 0.4758874611506847 | 2.099 |
| 0.47696018408933333 | 2.105 |
| 0.4776705059350819 | 2.11 |
| 0.4774358991729581 | 2.113 |
| 0.47798739945012314 | 2.117 |
| 0.47925416936315157 | 2.123 |
| 0.480437103609506 | 2.129 |
| 0.4813849579544237 | 2.134 |
| 0.48127125093585843 | 2.137 |
| 0.48075317146163393 | 2.14 |
| 0.4793364499091474 | 2.14 |
| 0.47901993388861913 | 2.143 |
| 0.47953264153275293 | 2.147 |
| 0.4830826166647179 | 2.158 |
| 0.48347344510674256 | 2.162 |
| 0.4835175605043024 | 2.166 |
| 0.48032328875601765 | 2.162 |
| 0.4792921496699936 | 2.163 |
| 0.47759442059082263 | 2.163 |
| 0.47791133821391285 | 2.167 |
| 0.4792161876137509 | 2.173 |
| 0.4803612284798453 | 2.179 |
| 0.4815428546456637 | 2.185 |
| 0.48327802518976765 | 2.192 |
| 0.4833978000191808 | 2.196 |
| 0.4833978000191808 | 2.2 |
| 0.48315828559720764 | 2.203 |
| 0.4834356232782342 | 2.207 |
| 0.4835175605043024 | 2.21 |
| 0.48450033342319204 | 2.216 |
| 0.4875620486985413 | 2.226 |
| 0.48587831355000644 | 2.226 |
| 0.4852493109400983 | 2.228 |
| 0.4835931965334568 | 2.228 |
| 0.48327802518976765 | 2.23 |
| 0.4835175605043024 | 2.234 |
| 0.4833978000191808 | 2.238 |
| 0.48347344510674256 | 2.242 |
| 0.4834356232782342 | 2.245 |
| 0.48394607253222716 | 2.249 |
| 0.48548209197817777 | 2.256 |
| 0.4852493109400983 | 2.259 |
| 0.48532481610481604 | 2.263 |
| 0.48532481610481604 | 2.266 |
| 0.4857210999852924 | 2.271 |
| 0.4875243811957059 | 2.279 |
| 0.4882711473658779 | 2.284 |
| 0.4890110465240229 | 2.289 |
| 0.4891301366871487 | 2.293 |
| 0.4885847491889366 | 2.295 |
| 0.4875620486985413 | 2.296 |
| 0.48591604310598774 | 2.296 |
| 0.48544434604555126 | 2.299 |
| 0.48744277163392297 | 2.307 |
| 0.4874867122739764 | 2.31 |
| 0.4876436485271529 | 2.314 |
| 0.4872104466107151 | 2.317 |
| 0.4876436485271529 | 2.322 |
| 0.4856393431197289 | 2.321 |
| 0.48567708169286566 | 2.324 |
| 0.4875997147825894 | 2.332 |
| 0.48862232745789175 | 2.339 |
| 0.48932441643551533 | 2.344 |
| 0.4907708646872644 | 2.351 |
| 0.49081465933505347 | 2.355 |
| 0.4910086121219838 | 2.359 |
| 0.49069576962504924 | 2.362 |
| 0.4910461486133736 | 2.366 |
| 0.4910461486133736 | 2.37 |
| 0.491552728805669 | 2.375 |
| 0.492608786992172 | 2.381 |
| 0.4925275913302549 | 2.385 |
| 0.4924901104068986 | 2.388 |
| 0.491202527298525 | 2.389 |
| 0.49097107422155284 | 2.392 |
| 0.4910461486133736 | 2.396 |
| 0.49081465933505347 | 2.399 |
| 0.49112746464626145 | 2.404 |
| 0.49237141973582127 | 2.41 |
| 0.4924901104068986 | 2.414 |
| 0.49264626346776796 | 2.418 |
| 0.492608786992172 | 2.422 |
| 0.4925275913302549 | 2.425 |
| 0.49257130911203756 | 2.429 |
| 0.49233393295844247 | 2.432 |
| 0.49264626346776796 | 2.437 |
| 0.49362011011620416 | 2.443 |
| 0.49436229069987875 | 2.449 |
| 0.49439970151914575 | 2.453 |
| 0.49424382204440825 | 2.456 |
| 0.49439970151914575 | 2.46 |
| 0.4941315678898997 | 2.464 |
| 0.4945181517103172 | 2.468 |
| 0.4944433375347708 | 2.472 |
| 0.4950603626586523 | 2.477 |
| 0.49623097248263137 | 2.484 |
| 0.4950603626586523 | 2.485 |
| 0.49448074532218905 | 2.487 |
| 0.4945181517103172 | 2.491 |
| 0.4946365878727024 | 2.495 |
| 0.49448074532218905 | 2.499 |
| 0.4931957244181844 | 2.499 |
| 0.49264626346776796 | 2.502 |
| 0.4941315678898997 | 2.509 |
| 0.49416898734153064 | 2.513 |
| 0.4946365878727024 | 2.518 |
| 0.4940879182674719 | 2.521 |
| 0.4946739884318867 | 2.526 |
| 0.497549443482252 | 2.537 |
| 0.497549443482252 | 2.541 |
| 0.4979409133726204 | 2.546 |
| 0.49778553610212634 | 2.55 |
| 0.4979781416992774 | 2.554 |
| 0.49952999370897233 | 2.562 |
| 0.4997594744774303 | 2.567 |
| 0.501809976056869 | 2.576 |
| 0.5016985680767155 | 2.579 |
| 0.5016985680767155 | 2.583 |
| 0.49984008508355243 | 2.582 |
| 0.4993377355929081 | 2.585 |
| 0.4979409133726204 | 2.585 |
| 0.49894681224147847 | 2.592 |
| 0.4997594744774303 | 2.598 |
| 0.4997594744774303 | 2.602 |
| 0.4997594744774303 | 2.606 |
| 0.49984008508355243 | 2.61 |
| 0.4998029260107264 | 2.614 |
| 0.49972226363898664 | 2.618 |
| 0.49960442831089213 | 2.621 |
| 0.5002616122056007 | 2.627 |
| 0.501809976056869 | 2.635 |
| 0.5025832112423622 | 2.641 |
| 0.5033558975902656 | 2.647 |
| 0.5033188203398588 | 2.651 |
| 0.5028552629890115 | 2.654 |
| 0.5018532899197357 | 2.655 |
| 0.5006891982670983 | 2.656 |
| 0.4998029260107264 | 2.658 |
| 0.5014262014242471 | 2.666 |
| 0.5018904215468075 | 2.671 |
| 0.5018532899197357 | 2.675 |
| 0.5016552475115846 | 2.679 |
| 0.5017728414425495 | 2.683 |
| 0.501735705449199 | 2.687 |
| 0.5016552475115846 | 2.691 |
| 0.5018532899197357 | 2.695 |
| 0.502626540255688 | 2.701 |
| 0.5035103632403689 | 2.708 |
| 0.5051338453512058 | 2.716 |
| 0.5052880366346012 | 2.721 |
| 0.5053990454583164 | 2.725 |
| 0.5040106215038425 | 2.726 |
| 0.5037018694592222 | 2.729 |
| 0.5035474333897034 | 2.732 |
| 0.5037821629048502 | 2.737 |
| 0.5053620438862788 | 2.745 |
| 0.5052078640146138 | 2.749 |
| 0.5053250409450742 | 2.753 |
| 0.5052078640146138 | 2.757 |
| 0.504899432938655 | 2.76 |
| 0.5037018694592222 | 2.761 |
| 0.5041279873549187 | 2.767 |
| 0.5053250409450742 | 2.774 |
| 0.5067115939604668 | 2.782 |
| 0.5069763760337302 | 2.787 |
| 0.5069763760337302 | 2.791 |
| 0.5068655421793022 | 2.795 |
| 0.5067854959374221 | 2.799 |
| 0.5054792027528658 | 2.799 |
| 0.50544220414671 | 2.803 |
| 0.5069763760337302 | 2.812 |
| 0.5078994657093358 | 2.818 |
| 0.508784780603683 | 2.825 |
| 0.508784780603683 | 2.829 |
| 0.5083606912081975 | 2.832 |
| 0.5070564069984455 | 2.833 |
| 0.5067854959374221 | 2.836 |
| 0.5069763760337302 | 2.841 |
| 0.5085942454167387 | 2.849 |
| 0.5091288313298178 | 2.855 |
| 0.5107003426067369 | 2.863 |
| 0.5104365448691783 | 2.867 |
| 0.5105101720870807 | 2.871 |
| 0.5089015391751681 | 2.87 |
| 0.5086680083980417 | 2.873 |
| 0.5088585295323996 | 2.878 |
| 0.5087110262356607 | 2.881 |
| 0.5087479040996351 | 2.885 |
| 0.5088585295323996 | 2.89 |
| 0.5086680083980417 | 2.893 |
| 0.5088216557479043 | 2.898 |
| 0.5077456282108711 | 2.898 |
| 0.5068655421793022 | 2.9 |
| 0.5084774509584643 | 2.908 |
| 0.5089015391751681 | 2.914 |
| 0.510663536675604 | 2.922 |
| 0.5115464571507593 | 2.929 |
| 0.5123122031465831 | 2.935 |
| 0.5109701470840506 | 2.935 |
| 0.5103199653957191 | 2.936 |
| 0.5107003426067369 | 2.94 |
| 0.5105101720870807 | 2.943 |
| 0.5107003426067369 | 2.947 |
| 0.5121162214545663 | 2.955 |
| 0.5124652916373508 | 2.959 |
| 0.512422435000787 | 2.963 |
| 0.5116567734422331 | 2.964 |
| 0.5107003426067369 | 2.965 |
| 0.510663536675604 | 2.967 |
| 0.5105101720870807 | 2.967 |
| 0.5107003426067369 | 2.966 |